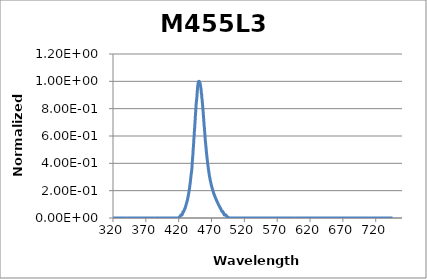
| Category | Normalized Intensity |
|---|---|
| 320.14817633 | 0 |
| 320.25686297 | 0 |
| 320.36555585 | 0 |
| 320.47425497 | 0 |
| 320.58296033 | 0 |
| 320.69167192 | 0 |
| 320.80038974 | 0 |
| 320.9091138 | 0 |
| 321.01784408 | 0 |
| 321.12658059 | 0 |
| 321.23532333 | 0 |
| 321.3440723 | 0 |
| 321.45282748 | 0 |
| 321.56158889 | 0 |
| 321.67035652 | 0 |
| 321.77913037 | 0 |
| 321.88791044 | 0 |
| 321.99669672 | 0 |
| 322.10548922 | 0 |
| 322.21428793 | 0 |
| 322.32309285 | 0 |
| 322.43190398 | 0 |
| 322.54072132 | 0 |
| 322.64954486 | 0 |
| 322.75837461 | 0 |
| 322.86721057 | 0 |
| 322.97605272 | 0 |
| 323.08490108 | 0 |
| 323.19375563 | 0 |
| 323.30261639 | 0 |
| 323.41148333 | 0 |
| 323.52035648 | 0 |
| 323.62923581 | 0 |
| 323.73812134 | 0 |
| 323.84701305 | 0 |
| 323.95591096 | 0 |
| 324.06481505 | 0 |
| 324.17372533 | 0 |
| 324.28264178 | 0 |
| 324.39156443 | 0 |
| 324.50049325 | 0 |
| 324.60942825 | 0 |
| 324.71836943 | 0 |
| 324.82731678 | 0 |
| 324.93627031 | 0 |
| 325.04523001 | 0 |
| 325.15419588 | 0 |
| 325.26316792 | 0 |
| 325.37214613 | 0 |
| 325.48113051 | 0 |
| 325.59012105 | 0 |
| 325.69911775 | 0 |
| 325.80812062 | 0 |
| 325.91712964 | 0 |
| 326.02614483 | 0 |
| 326.13516617 | 0 |
| 326.24419367 | 0 |
| 326.35322732 | 0 |
| 326.46226713 | 0 |
| 326.57131308 | 0 |
| 326.68036519 | 0 |
| 326.78942344 | 0 |
| 326.89848784 | 0 |
| 327.00755839 | 0 |
| 327.11663508 | 0 |
| 327.22571791 | 0 |
| 327.33480688 | 0 |
| 327.44390199 | 0 |
| 327.55300323 | 0 |
| 327.66211061 | 0 |
| 327.77122413 | 0 |
| 327.88034378 | 0 |
| 327.98946956 | 0 |
| 328.09860147 | 0 |
| 328.20773951 | 0 |
| 328.31688367 | 0 |
| 328.42603396 | 0 |
| 328.53519037 | 0 |
| 328.6443529 | 0 |
| 328.75352156 | 0 |
| 328.86269633 | 0 |
| 328.97187722 | 0 |
| 329.08106423 | 0 |
| 329.19025735 | 0 |
| 329.29945658 | 0 |
| 329.40866192 | 0 |
| 329.51787337 | 0 |
| 329.62709093 | 0 |
| 329.7363146 | 0 |
| 329.84554437 | 0 |
| 329.95478025 | 0 |
| 330.06402222 | 0 |
| 330.1732703 | 0 |
| 330.28252448 | 0 |
| 330.39178475 | 0 |
| 330.50105112 | 0 |
| 330.61032358 | 0 |
| 330.71960213 | 0 |
| 330.82888678 | 0 |
| 330.93817751 | 0 |
| 331.04747434 | 0 |
| 331.15677725 | 0 |
| 331.26608624 | 0 |
| 331.37540132 | 0 |
| 331.48472248 | 0 |
| 331.59404972 | 0 |
| 331.70338303 | 0 |
| 331.81272243 | 0 |
| 331.9220679 | 0 |
| 332.03141944 | 0 |
| 332.14077706 | 0 |
| 332.25014075 | 0 |
| 332.3595105 | 0 |
| 332.46888633 | 0 |
| 332.57826822 | 0 |
| 332.68765617 | 0 |
| 332.79705019 | 0 |
| 332.90645027 | 0 |
| 333.01585641 | 0 |
| 333.12526861 | 0 |
| 333.23468687 | 0 |
| 333.34411118 | 0 |
| 333.45354155 | 0 |
| 333.56297796 | 0 |
| 333.67242043 | 0 |
| 333.78186895 | 0 |
| 333.89132352 | 0 |
| 334.00078413 | 0 |
| 334.11025079 | 0 |
| 334.21972349 | 0 |
| 334.32920223 | 0 |
| 334.43868701 | 0 |
| 334.54817783 | 0 |
| 334.65767469 | 0 |
| 334.76717758 | 0 |
| 334.8766865 | 0 |
| 334.98620146 | 0 |
| 335.09572245 | 0 |
| 335.20524947 | 0 |
| 335.31478252 | 0 |
| 335.42432159 | 0 |
| 335.53386669 | 0 |
| 335.64341781 | 0 |
| 335.75297495 | 0 |
| 335.86253811 | 0 |
| 335.97210729 | 0 |
| 336.08168249 | 0 |
| 336.1912637 | 0 |
| 336.30085093 | 0 |
| 336.41044416 | 0 |
| 336.52004341 | 0 |
| 336.62964867 | 0 |
| 336.73925994 | 0 |
| 336.84887721 | 0 |
| 336.95850049 | 0 |
| 337.06812977 | 0 |
| 337.17776505 | 0 |
| 337.28740633 | 0 |
| 337.39705361 | 0 |
| 337.50670688 | 0 |
| 337.61636616 | 0 |
| 337.72603142 | 0 |
| 337.83570268 | 0 |
| 337.94537993 | 0 |
| 338.05506317 | 0 |
| 338.16475239 | 0 |
| 338.2744476 | 0 |
| 338.3841488 | 0 |
| 338.49385598 | 0 |
| 338.60356914 | 0 |
| 338.71328828 | 0 |
| 338.8230134 | 0 |
| 338.93274449 | 0 |
| 339.04248156 | 0 |
| 339.15222461 | 0 |
| 339.26197362 | 0 |
| 339.37172861 | 0 |
| 339.48148957 | 0 |
| 339.59125649 | 0 |
| 339.70102938 | 0 |
| 339.81080823 | 0 |
| 339.92059305 | 0 |
| 340.03038383 | 0 |
| 340.14018057 | 0 |
| 340.24998327 | 0 |
| 340.35979192 | 0 |
| 340.46960653 | 0 |
| 340.57942709 | 0 |
| 340.6892536 | 0 |
| 340.79908607 | 0 |
| 340.90892448 | 0 |
| 341.01876885 | 0 |
| 341.12861915 | 0 |
| 341.2384754 | 0 |
| 341.3483376 | 0 |
| 341.45820574 | 0 |
| 341.56807981 | 0 |
| 341.67795983 | 0 |
| 341.78784578 | 0 |
| 341.89773766 | 0 |
| 342.00763548 | 0 |
| 342.11753924 | 0 |
| 342.22744892 | 0 |
| 342.33736453 | 0 |
| 342.44728607 | 0 |
| 342.55721353 | 0 |
| 342.66714692 | 0 |
| 342.77708623 | 0 |
| 342.88703147 | 0 |
| 342.99698262 | 0 |
| 343.10693969 | 0 |
| 343.21690268 | 0 |
| 343.32687158 | 0 |
| 343.4368464 | 0 |
| 343.54682713 | 0 |
| 343.65681377 | 0 |
| 343.76680631 | 0 |
| 343.87680477 | 0 |
| 343.98680913 | 0 |
| 344.0968194 | 0 |
| 344.20683557 | 0 |
| 344.31685763 | 0 |
| 344.4268856 | 0 |
| 344.53691947 | 0 |
| 344.64695924 | 0 |
| 344.75700489 | 0 |
| 344.86705645 | 0 |
| 344.97711389 | 0 |
| 345.08717723 | 0 |
| 345.19724645 | 0 |
| 345.30732156 | 0 |
| 345.41740256 | 0 |
| 345.52748944 | 0 |
| 345.63758221 | 0 |
| 345.74768085 | 0 |
| 345.85778538 | 0 |
| 345.96789578 | 0 |
| 346.07801206 | 0 |
| 346.18813421 | 0 |
| 346.29826224 | 0 |
| 346.40839614 | 0 |
| 346.51853591 | 0 |
| 346.62868155 | 0 |
| 346.73883306 | 0 |
| 346.84899043 | 0 |
| 346.95915367 | 0 |
| 347.06932277 | 0 |
| 347.17949773 | 0 |
| 347.28967855 | 0 |
| 347.39986522 | 0 |
| 347.51005776 | 0 |
| 347.62025615 | 0 |
| 347.73046039 | 0 |
| 347.84067049 | 0 |
| 347.95088643 | 0 |
| 348.06110823 | 0 |
| 348.17133587 | 0 |
| 348.28156935 | 0 |
| 348.39180868 | 0 |
| 348.50205386 | 0 |
| 348.61230487 | 0 |
| 348.72256173 | 0 |
| 348.83282442 | 0 |
| 348.94309295 | 0 |
| 349.05336731 | 0 |
| 349.16364751 | 0 |
| 349.27393354 | 0 |
| 349.3842254 | 0 |
| 349.49452309 | 0 |
| 349.6048266 | 0 |
| 349.71513594 | 0 |
| 349.82545111 | 0 |
| 349.93577209 | 0 |
| 350.0460989 | 0 |
| 350.15643153 | 0 |
| 350.26676998 | 0 |
| 350.37711424 | 0 |
| 350.48746432 | 0 |
| 350.59782021 | 0 |
| 350.70818191 | 0 |
| 350.81854942 | 0 |
| 350.92892274 | 0 |
| 351.03930187 | 0 |
| 351.14968681 | 0 |
| 351.26007754 | 0 |
| 351.37047409 | 0 |
| 351.48087643 | 0 |
| 351.59128457 | 0 |
| 351.70169851 | 0 |
| 351.81211824 | 0 |
| 351.92254377 | 0 |
| 352.0329751 | 0 |
| 352.14341221 | 0 |
| 352.25385512 | 0 |
| 352.36430381 | 0 |
| 352.47475829 | 0 |
| 352.58521856 | 0 |
| 352.69568461 | 0 |
| 352.80615644 | 0 |
| 352.91663406 | 0 |
| 353.02711745 | 0 |
| 353.13760662 | 0 |
| 353.24810157 | 0 |
| 353.35860229 | 0 |
| 353.46910879 | 0 |
| 353.57962106 | 0 |
| 353.69013909 | 0 |
| 353.8006629 | 0 |
| 353.91119247 | 0 |
| 354.02172781 | 0 |
| 354.13226891 | 0 |
| 354.24281578 | 0 |
| 354.3533684 | 0 |
| 354.46392679 | 0 |
| 354.57449093 | 0 |
| 354.68506083 | 0 |
| 354.79563649 | 0 |
| 354.90621789 | 0 |
| 355.01680505 | 0 |
| 355.12739796 | 0 |
| 355.23799662 | 0 |
| 355.34860102 | 0 |
| 355.45921117 | 0 |
| 355.56982707 | 0 |
| 355.6804487 | 0 |
| 355.79107608 | 0 |
| 355.9017092 | 0 |
| 356.01234805 | 0 |
| 356.12299264 | 0 |
| 356.23364297 | 0 |
| 356.34429902 | 0 |
| 356.45496081 | 0 |
| 356.56562833 | 0 |
| 356.67630158 | 0 |
| 356.78698056 | 0 |
| 356.89766526 | 0 |
| 357.00835568 | 0 |
| 357.11905183 | 0 |
| 357.2297537 | 0 |
| 357.34046128 | 0 |
| 357.45117459 | 0 |
| 357.56189361 | 0 |
| 357.67261835 | 0 |
| 357.78334879 | 0 |
| 357.89408495 | 0 |
| 358.00482682 | 0 |
| 358.1155744 | 0 |
| 358.22632769 | 0 |
| 358.33708668 | 0 |
| 358.44785137 | 0 |
| 358.55862177 | 0 |
| 358.66939787 | 0 |
| 358.78017966 | 0 |
| 358.89096716 | 0 |
| 359.00176035 | 0 |
| 359.11255923 | 0 |
| 359.22336381 | 0 |
| 359.33417408 | 0 |
| 359.44499004 | 0 |
| 359.55581169 | 0 |
| 359.66663902 | 0 |
| 359.77747204 | 0 |
| 359.88831075 | 0 |
| 359.99915513 | 0 |
| 360.1100052 | 0 |
| 360.22086094 | 0 |
| 360.33172237 | 0 |
| 360.44258947 | 0 |
| 360.55346224 | 0 |
| 360.66434069 | 0 |
| 360.77522481 | 0 |
| 360.8861146 | 0 |
| 360.99701005 | 0 |
| 361.10791118 | 0 |
| 361.21881796 | 0 |
| 361.32973042 | 0 |
| 361.44064853 | 0 |
| 361.55157231 | 0 |
| 361.66250174 | 0 |
| 361.77343683 | 0 |
| 361.88437758 | 0 |
| 361.99532398 | 0 |
| 362.10627604 | 0 |
| 362.21723374 | 0 |
| 362.3281971 | 0 |
| 362.43916611 | 0 |
| 362.55014076 | 0 |
| 362.66112105 | 0 |
| 362.77210699 | 0 |
| 362.88309858 | 0 |
| 362.9940958 | 0 |
| 363.10509866 | 0 |
| 363.21610716 | 0 |
| 363.3271213 | 0 |
| 363.43814107 | 0 |
| 363.54916647 | 0 |
| 363.6601975 | 0 |
| 363.77123417 | 0 |
| 363.88227646 | 0 |
| 363.99332438 | 0 |
| 364.10437792 | 0 |
| 364.21543709 | 0 |
| 364.32650188 | 0 |
| 364.43757229 | 0 |
| 364.54864832 | 0 |
| 364.65972997 | 0 |
| 364.77081723 | 0 |
| 364.88191011 | 0 |
| 364.9930086 | 0 |
| 365.1041127 | 0 |
| 365.21522241 | 0 |
| 365.32633773 | 0 |
| 365.43745866 | 0 |
| 365.54858519 | 0 |
| 365.65971732 | 0 |
| 365.77085506 | 0 |
| 365.88199839 | 0 |
| 365.99314733 | 0 |
| 366.10430186 | 0 |
| 366.21546199 | 0 |
| 366.32662772 | 0 |
| 366.43779903 | 0 |
| 366.54897594 | 0 |
| 366.66015844 | 0 |
| 366.77134652 | 0 |
| 366.88254019 | 0 |
| 366.99373945 | 0 |
| 367.10494429 | 0 |
| 367.21615471 | 0 |
| 367.32737072 | 0 |
| 367.4385923 | 0 |
| 367.54981946 | 0 |
| 367.66105219 | 0 |
| 367.7722905 | 0 |
| 367.88353438 | 0 |
| 367.99478384 | 0 |
| 368.10603886 | 0 |
| 368.21729945 | 0 |
| 368.32856561 | 0 |
| 368.43983733 | 0 |
| 368.55111462 | 0 |
| 368.66239746 | 0 |
| 368.77368587 | 0 |
| 368.88497984 | 0 |
| 368.99627936 | 0 |
| 369.10758444 | 0 |
| 369.21889508 | 0 |
| 369.33021127 | 0 |
| 369.441533 | 0 |
| 369.55286029 | 0 |
| 369.66419313 | 0 |
| 369.77553151 | 0 |
| 369.88687544 | 0 |
| 369.99822491 | 0 |
| 370.10957992 | 0 |
| 370.22094047 | 0 |
| 370.33230656 | 0 |
| 370.44367819 | 0 |
| 370.55505536 | 0 |
| 370.66643806 | 0 |
| 370.77782629 | 0 |
| 370.88922005 | 0 |
| 371.00061934 | 0 |
| 371.11202416 | 0 |
| 371.22343451 | 0 |
| 371.33485038 | 0 |
| 371.44627178 | 0 |
| 371.55769869 | 0 |
| 371.66913113 | 0 |
| 371.78056908 | 0 |
| 371.89201256 | 0 |
| 372.00346155 | 0 |
| 372.11491605 | 0 |
| 372.22637606 | 0 |
| 372.33784159 | 0 |
| 372.44931262 | 0 |
| 372.56078917 | 0 |
| 372.67227122 | 0 |
| 372.78375877 | 0 |
| 372.89525183 | 0 |
| 373.00675039 | 0 |
| 373.11825445 | 0 |
| 373.22976401 | 0 |
| 373.34127907 | 0 |
| 373.45279962 | 0 |
| 373.56432566 | 0 |
| 373.6758572 | 0 |
| 373.78739423 | 0 |
| 373.89893675 | 0 |
| 374.01048476 | 0 |
| 374.12203825 | 0 |
| 374.23359723 | 0 |
| 374.34516169 | 0 |
| 374.45673163 | 0 |
| 374.56830705 | 0 |
| 374.67988796 | 0 |
| 374.79147433 | 0 |
| 374.90306619 | 0 |
| 375.01466352 | 0 |
| 375.12626632 | 0 |
| 375.23787459 | 0 |
| 375.34948833 | 0 |
| 375.46110754 | 0 |
| 375.57273221 | 0 |
| 375.68436235 | 0 |
| 375.79599796 | 0 |
| 375.90763902 | 0 |
| 376.01928555 | 0 |
| 376.13093753 | 0 |
| 376.24259497 | 0 |
| 376.35425787 | 0 |
| 376.46592622 | 0 |
| 376.57760002 | 0 |
| 376.68927927 | 0 |
| 376.80096397 | 0 |
| 376.91265413 | 0 |
| 377.02434972 | 0 |
| 377.13605076 | 0 |
| 377.24775725 | 0 |
| 377.35946917 | 0 |
| 377.47118654 | 0 |
| 377.58290935 | 0 |
| 377.69463759 | 0 |
| 377.80637126 | 0 |
| 377.91811038 | 0 |
| 378.02985492 | 0 |
| 378.14160489 | 0 |
| 378.2533603 | 0 |
| 378.36512113 | 0 |
| 378.47688739 | 0 |
| 378.58865907 | 0 |
| 378.70043617 | 0 |
| 378.8122187 | 0 |
| 378.92400665 | 0 |
| 379.03580001 | 0 |
| 379.1475988 | 0 |
| 379.25940299 | 0 |
| 379.37121261 | 0 |
| 379.48302763 | 0 |
| 379.59484806 | 0 |
| 379.70667391 | 0 |
| 379.81850516 | 0 |
| 379.93034182 | 0 |
| 380.04218388 | 0 |
| 380.15403135 | 0 |
| 380.26588421 | 0 |
| 380.37774248 | 0 |
| 380.48960615 | 0 |
| 380.60147521 | 0 |
| 380.71334967 | 0 |
| 380.82522952 | 0 |
| 380.93711476 | 0 |
| 381.0490054 | 0 |
| 381.16090142 | 0 |
| 381.27280283 | 0 |
| 381.38470963 | 0 |
| 381.49662181 | 0 |
| 381.60853938 | 0 |
| 381.72046232 | 0 |
| 381.83239065 | 0 |
| 381.94432436 | 0 |
| 382.05626344 | 0 |
| 382.16820789 | 0 |
| 382.28015772 | 0 |
| 382.39211293 | 0 |
| 382.5040735 | 0 |
| 382.61603944 | 0 |
| 382.72801076 | 0 |
| 382.83998743 | 0 |
| 382.95196947 | 0 |
| 383.06395688 | 0 |
| 383.17594964 | 0 |
| 383.28794777 | 0 |
| 383.39995125 | 0 |
| 383.51196009 | 0 |
| 383.62397429 | 0 |
| 383.73599384 | 0 |
| 383.84801874 | 0 |
| 383.96004899 | 0 |
| 384.07208459 | 0 |
| 384.18412554 | 0 |
| 384.29617184 | 0 |
| 384.40822348 | 0 |
| 384.52028046 | 0 |
| 384.63234278 | 0 |
| 384.74441044 | 0 |
| 384.85648345 | 0 |
| 384.96856178 | 0 |
| 385.08064546 | 0 |
| 385.19273447 | 0 |
| 385.30482881 | 0 |
| 385.41692848 | 0 |
| 385.52903347 | 0 |
| 385.6411438 | 0 |
| 385.75325945 | 0 |
| 385.86538043 | 0 |
| 385.97750673 | 0 |
| 386.08963835 | 0 |
| 386.20177529 | 0 |
| 386.31391755 | 0 |
| 386.42606513 | 0 |
| 386.53821802 | 0 |
| 386.65037622 | 0 |
| 386.76253974 | 0 |
| 386.87470857 | 0 |
| 386.9868827 | 0 |
| 387.09906215 | 0 |
| 387.2112469 | 0 |
| 387.32343695 | 0 |
| 387.43563231 | 0 |
| 387.54783297 | 0 |
| 387.66003892 | 0 |
| 387.77225018 | 0 |
| 387.88446673 | 0 |
| 387.99668858 | 0 |
| 388.10891572 | 0 |
| 388.22114815 | 0 |
| 388.33338588 | 0 |
| 388.44562889 | 0 |
| 388.55787719 | 0 |
| 388.67013078 | 0 |
| 388.78238965 | 0 |
| 388.8946538 | 0 |
| 389.00692323 | 0 |
| 389.11919795 | 0 |
| 389.23147794 | 0 |
| 389.34376321 | 0 |
| 389.45605375 | 0 |
| 389.56834957 | 0 |
| 389.68065066 | 0 |
| 389.79295702 | 0 |
| 389.90526865 | 0 |
| 390.01758554 | 0 |
| 390.1299077 | 0 |
| 390.24223513 | 0 |
| 390.35456782 | 0 |
| 390.46690577 | 0 |
| 390.57924898 | 0 |
| 390.69159745 | 0 |
| 390.80395117 | 0 |
| 390.91631015 | 0 |
| 391.02867438 | 0 |
| 391.14104387 | 0 |
| 391.2534186 | 0 |
| 391.36579858 | 0 |
| 391.47818382 | 0 |
| 391.59057429 | 0 |
| 391.70297001 | 0 |
| 391.81537098 | 0 |
| 391.92777718 | 0 |
| 392.04018863 | 0 |
| 392.15260531 | 0 |
| 392.26502723 | 0 |
| 392.37745438 | 0 |
| 392.48988677 | 0 |
| 392.60232439 | 0 |
| 392.71476724 | 0 |
| 392.82721532 | 0 |
| 392.93966862 | 0 |
| 393.05212715 | 0 |
| 393.16459091 | 0 |
| 393.27705989 | 0 |
| 393.38953408 | 0 |
| 393.5020135 | 0 |
| 393.61449814 | 0 |
| 393.72698799 | 0 |
| 393.83948306 | 0 |
| 393.95198334 | 0 |
| 394.06448883 | 0 |
| 394.17699954 | 0 |
| 394.28951545 | 0 |
| 394.40203657 | 0 |
| 394.51456289 | 0 |
| 394.62709442 | 0 |
| 394.73963116 | 0 |
| 394.85217309 | 0 |
| 394.96472022 | 0 |
| 395.07727255 | 0 |
| 395.18983008 | 0 |
| 395.3023928 | 0 |
| 395.41496071 | 0 |
| 395.52753382 | 0 |
| 395.64011212 | 0 |
| 395.7526956 | 0 |
| 395.86528427 | 0 |
| 395.97787813 | 0 |
| 396.09047717 | 0 |
| 396.2030814 | 0 |
| 396.3156908 | 0 |
| 396.42830539 | 0 |
| 396.54092515 | 0 |
| 396.65355009 | 0 |
| 396.76618021 | 0 |
| 396.87881549 | 0 |
| 396.99145595 | 0 |
| 397.10410158 | 0 |
| 397.21675238 | 0 |
| 397.32940834 | 0 |
| 397.44206947 | 0 |
| 397.55473577 | 0 |
| 397.66740723 | 0 |
| 397.78008384 | 0 |
| 397.89276562 | 0 |
| 398.00545256 | 0 |
| 398.11814465 | 0 |
| 398.23084189 | 0 |
| 398.34354429 | 0 |
| 398.45625184 | 0 |
| 398.56896455 | 0 |
| 398.6816824 | 0 |
| 398.79440539 | 0 |
| 398.90713353 | 0 |
| 399.01986682 | 0 |
| 399.13260525 | 0 |
| 399.24534882 | 0 |
| 399.35809753 | 0 |
| 399.47085137 | 0 |
| 399.58361036 | 0 |
| 399.69637448 | 0 |
| 399.80914373 | 0 |
| 399.92191811 | 0 |
| 400.03469762 | 0 |
| 400.14748226 | 0 |
| 400.26027203 | 0 |
| 400.37306692 | 0 |
| 400.48586694 | 0 |
| 400.59867208 | 0 |
| 400.71148234 | 0 |
| 400.82429772 | 0 |
| 400.93711822 | 0 |
| 401.04994383 | 0 |
| 401.16277456 | 0 |
| 401.2756104 | 0 |
| 401.38845136 | 0 |
| 401.50129742 | 0 |
| 401.61414859 | 0 |
| 401.72700487 | 0 |
| 401.83986625 | 0 |
| 401.95273274 | 0 |
| 402.06560433 | 0 |
| 402.17848102 | 0 |
| 402.29136281 | 0 |
| 402.4042497 | 0 |
| 402.51714169 | 0 |
| 402.63003876 | 0 |
| 402.74294094 | 0 |
| 402.8558482 | 0 |
| 402.96876055 | 0 |
| 403.08167799 | 0 |
| 403.19460052 | 0 |
| 403.30752814 | 0 |
| 403.42046083 | 0 |
| 403.53339861 | 0 |
| 403.64634147 | 0 |
| 403.75928941 | 0 |
| 403.87224243000003 | 0 |
| 403.98520053 | 0 |
| 404.09816369 | 0 |
| 404.21113193 | 0 |
| 404.32410525 | 0 |
| 404.43708363 | 0 |
| 404.55006708 | 0 |
| 404.6630556 | 0 |
| 404.77604918 | 0 |
| 404.88904783 | 0 |
| 405.00205154 | 0 |
| 405.11506031 | 0 |
| 405.22807414 | 0 |
| 405.34109302 | 0 |
| 405.45411697 | 0 |
| 405.56714596 | 0 |
| 405.68018001 | 0 |
| 405.79321911 | 0 |
| 405.90626326 | 0 |
| 406.01931246 | 0 |
| 406.13236671 | 0 |
| 406.245426 | 0 |
| 406.35849034 | 0 |
| 406.47155972 | 0 |
| 406.58463413 | 0 |
| 406.69771359 | 0 |
| 406.81079809 | 0 |
| 406.92388762 | 0 |
| 407.03698218 | 0 |
| 407.15008178 | 0 |
| 407.26318641 | 0 |
| 407.37629607 | 0 |
| 407.48941076 | 0 |
| 407.60253047 | 0 |
| 407.71565521 | 0 |
| 407.82878497 | 0 |
| 407.94191976 | 0 |
| 408.05505956 | 0 |
| 408.16820439 | 0 |
| 408.28135423 | 0 |
| 408.39450909 | 0 |
| 408.50766896 | 0 |
| 408.62083385 | 0 |
| 408.73400375 | 0 |
| 408.84717865 | 0 |
| 408.96035857 | 0 |
| 409.07354349 | 0 |
| 409.18673342 | 0 |
| 409.29992835 | 0 |
| 409.41312828 | 0 |
| 409.52633321 | 0 |
| 409.63954314 | 0 |
| 409.75275807 | 0 |
| 409.865978 | 0 |
| 409.97920292 | 0 |
| 410.09243283 | 0 |
| 410.20566773 | 0 |
| 410.31890763 | 0 |
| 410.43215251 | 0 |
| 410.54540238 | 0 |
| 410.65865723 | 0 |
| 410.77191707 | 0 |
| 410.88518189 | 0 |
| 410.99845169 | 0 |
| 411.11172647 | 0 |
| 411.22500622 | 0 |
| 411.33829095 | 0 |
| 411.45158066 | 0 |
| 411.56487534 | 0 |
| 411.67817499 | 0 |
| 411.79147961 | 0 |
| 411.9047892 | 0 |
| 412.01810375 | 0 |
| 412.13142327 | 0 |
| 412.24474775 | 0 |
| 412.3580772 | 0 |
| 412.4714116 | 0 |
| 412.58475097 | 0 |
| 412.69809529 | 0 |
| 412.81144456 | 0 |
| 412.9247988 | 0 |
| 413.03815798 | 0 |
| 413.15152212 | 0 |
| 413.2648912 | 0 |
| 413.37826523 | 0 |
| 413.49164421 | 0 |
| 413.60502814 | 0 |
| 413.71841701 | 0 |
| 413.83181082 | 0 |
| 413.94520957 | 0 |
| 414.05861326 | 0 |
| 414.17202188 | 0 |
| 414.28543545 | 0 |
| 414.39885394 | 0 |
| 414.51227737 | 0 |
| 414.62570573 | 0 |
| 414.73913902 | 0 |
| 414.85257724 | 0 |
| 414.96602038 | 0 |
| 415.07946845 | 0 |
| 415.19292145 | 0 |
| 415.30637936 | 0 |
| 415.4198422 | 0 |
| 415.53330995 | 0 |
| 415.64678262 | 0 |
| 415.76026021 | 0 |
| 415.87374271 | 0 |
| 415.98723012 | 0 |
| 416.10072245 | 0 |
| 416.21421968 | 0 |
| 416.32772182 | 0 |
| 416.44122887 | 0 |
| 416.55474082 | 0 |
| 416.66825768 | 0 |
| 416.78177944 | 0 |
| 416.8953061 | 0 |
| 417.00883765 | 0 |
| 417.12237411 | 0 |
| 417.23591546 | 0 |
| 417.3494617 | 0 |
| 417.46301284 | 0 |
| 417.57656887 | 0 |
| 417.69012979 | 0 |
| 417.80369559 | 0 |
| 417.91726628 | 0 |
| 418.03084186 | 0 |
| 418.14442232 | 0 |
| 418.25800766 | 0 |
| 418.37159788 | 0 |
| 418.48519298 | 0 |
| 418.59879296 | 0 |
| 418.71239782 | 0 |
| 418.82600754 | 0 |
| 418.93962214 | 0 |
| 419.05324161 | 0 |
| 419.16686595 | 0 |
| 419.28049516 | 0 |
| 419.39412924 | 0 |
| 419.50776818 | 0 |
| 419.62141198 | 0 |
| 419.73506064 | 0.001 |
| 419.84871417 | 0.001 |
| 419.96237255 | 0.002 |
| 420.07603579 | 0.002 |
| 420.18970389 | 0.003 |
| 420.30337684 | 0.003 |
| 420.41705464 | 0.004 |
| 420.53073729 | 0.004 |
| 420.6444248 | 0.005 |
| 420.75811715 | 0.004 |
| 420.87181434 | 0.006 |
| 420.98551638 | 0.006 |
| 421.09922327 | 0.007 |
| 421.212935 | 0.007 |
| 421.32665156 | 0.008 |
| 421.44037297 | 0.008 |
| 421.55409921 | 0.01 |
| 421.66783029 | 0.01 |
| 421.7815662 | 0.011 |
| 421.89530694 | 0.011 |
| 422.00905252 | 0.012 |
| 422.12280292 | 0.012 |
| 422.23655815 | 0.014 |
| 422.35031821 | 0.014 |
| 422.46408309 | 0.016 |
| 422.5778528 | 0.016 |
| 422.69162733 | 0.018 |
| 422.80540667 | 0.018 |
| 422.91919084 | 0.02 |
| 423.03297982 | 0.021 |
| 423.14677362 | 0.022 |
| 423.26057223 | 0.022 |
| 423.37437566 | 0.023 |
| 423.4881839 | 0.023 |
| 423.60199694 | 0.023 |
| 423.71581479 | 0.023 |
| 423.82963745 | 0.022 |
| 423.94346492 | 0.024 |
| 424.05729718 | 0.023 |
| 424.17113425 | 0.024 |
| 424.28497612 | 0.024 |
| 424.39882279 | 0.025 |
| 424.51267425 | 0.025 |
| 424.62653051 | 0.024 |
| 424.74039156 | 0.024 |
| 424.85425741 | 0.023 |
| 424.96812804 | 0.023 |
| 425.08200347 | 0.022 |
| 425.19588368 | 0.024 |
| 425.30976868 | 0.024 |
| 425.42365846 | 0.026 |
| 425.53755303 | 0.026 |
| 425.65145238 | 0.031 |
| 425.76535651 | 0.031 |
| 425.87926541 | 0.035 |
| 425.9931791 | 0.034 |
| 426.10709756 | 0.036 |
| 426.22102079 | 0.036 |
| 426.33494879 | 0.037 |
| 426.44888157 | 0.04 |
| 426.56281911 | 0.043 |
| 426.67676143 | 0.046 |
| 426.7907085 | 0.047 |
| 426.90466035 | 0.047 |
| 427.01861695 | 0.047 |
| 427.13257832 | 0.046 |
| 427.24654445 | 0.046 |
| 427.36051534 | 0.045 |
| 427.47449098 | 0.047 |
| 427.58847138 | 0.047 |
| 427.70245653 | 0.049 |
| 427.81644643 | 0.048 |
| 427.93044109 | 0.05 |
| 428.04444049 | 0.051 |
| 428.15844464 | 0.053 |
| 428.27245354 | 0.054 |
| 428.38646718 | 0.057 |
| 428.50048557 | 0.058 |
| 428.61450869 | 0.06 |
| 428.72853656 | 0.061 |
| 428.84256916 | 0.063 |
| 428.9566065 | 0.064 |
| 429.07064858 | 0.065 |
| 429.18469539 | 0.066 |
| 429.29874693 | 0.069 |
| 429.41280321 | 0.07 |
| 429.52686421 | 0.071 |
| 429.64092994 | 0.071 |
| 429.75500039 | 0.073 |
| 429.86907557 | 0.074 |
| 429.98315548 | 0.076 |
| 430.0972401 | 0.077 |
| 430.21132944 | 0.079 |
| 430.32542351 | 0.081 |
| 430.43952229 | 0.083 |
| 430.55362578 | 0.084 |
| 430.66773399 | 0.086 |
| 430.78184691 | 0.088 |
| 430.89596454 | 0.09 |
| 431.01008688 | 0.093 |
| 431.12421393 | 0.094 |
| 431.23834568 | 0.096 |
| 431.35248214 | 0.098 |
| 431.4666233 | 0.1 |
| 431.58076916 | 0.101 |
| 431.69491972 | 0.104 |
| 431.80907498 | 0.105 |
| 431.92323494 | 0.108 |
| 432.03739959 | 0.108 |
| 432.15156893 | 0.111 |
| 432.26574297 | 0.112 |
| 432.3799217 | 0.115 |
| 432.49410511 | 0.117 |
| 432.60829322 | 0.12 |
| 432.72248601 | 0.122 |
| 432.83668348 | 0.125 |
| 432.95088564 | 0.126 |
| 433.06509248 | 0.129 |
| 433.179304 | 0.13 |
| 433.29352019 | 0.133 |
| 433.40774107 | 0.135 |
| 433.52196661 | 0.138 |
| 433.63619684 | 0.139 |
| 433.75043173 | 0.143 |
| 433.86467129 | 0.145 |
| 433.97891553 | 0.148 |
| 434.09316443 | 0.15 |
| 434.20741799 | 0.153 |
| 434.32167622 | 0.155 |
| 434.43593912 | 0.158 |
| 434.55020667 | 0.161 |
| 434.66447889 | 0.165 |
| 434.77875576 | 0.168 |
| 434.89303729 | 0.172 |
| 435.00732347 | 0.174 |
| 435.12161431 | 0.177 |
| 435.2359098 | 0.179 |
| 435.35020994 | 0.182 |
| 435.46451473 | 0.185 |
| 435.57882416 | 0.19 |
| 435.69313824 | 0.192 |
| 435.80745697 | 0.197 |
| 435.92178034 | 0.2 |
| 436.03610835 | 0.204 |
| 436.150441 | 0.206 |
| 436.26477829 | 0.211 |
| 436.37912021 | 0.214 |
| 436.49346677 | 0.219 |
| 436.60781796 | 0.222 |
| 436.72217379 | 0.227 |
| 436.83653424 | 0.231 |
| 436.95089932 | 0.236 |
| 437.06526904 | 0.239 |
| 437.17964337 | 0.244 |
| 437.29402233 | 0.247 |
| 437.40840592 | 0.251 |
| 437.52279412 | 0.255 |
| 437.63718695 | 0.26 |
| 437.75158439 | 0.264 |
| 437.86598645 | 0.271 |
| 437.98039312 | 0.275 |
| 438.09480441 | 0.281 |
| 438.20922031 | 0.284 |
| 438.32364082 | 0.289 |
| 438.43806593 | 0.294 |
| 438.55249566 | 0.3 |
| 438.66692999 | 0.305 |
| 438.78136893 | 0.311 |
| 438.89581246 | 0.314 |
| 439.0102606 | 0.319 |
| 439.12471334 | 0.322 |
| 439.23917068 | 0.327 |
| 439.35363261 | 0.33 |
| 439.46809914 | 0.334 |
| 439.58257026 | 0.338 |
| 439.69704597 | 0.344 |
| 439.81152627 | 0.348 |
| 439.92601117 | 0.355 |
| 440.04050065 | 0.359 |
| 440.15499471 | 0.367 |
| 440.26949336 | 0.374 |
| 440.38399659 | 0.384 |
| 440.4985044 | 0.392 |
| 440.61301679 | 0.402 |
| 440.72753376 | 0.408 |
| 440.84205531 | 0.416 |
| 440.95658143 | 0.422 |
| 441.07111213 | 0.43 |
| 441.18564739 | 0.437 |
| 441.30018723 | 0.445 |
| 441.41473163 | 0.451 |
| 441.5292806 | 0.459 |
| 441.64383414 | 0.465 |
| 441.75839224 | 0.474 |
| 441.87295491 | 0.484 |
| 441.98752213 | 0.495 |
| 442.10209392 | 0.503 |
| 442.21667026 | 0.511 |
| 442.33125116 | 0.516 |
| 442.44583661 | 0.522 |
| 442.56042662 | 0.528 |
| 442.67502118 | 0.537 |
| 442.78962029 | 0.547 |
| 442.90422394 | 0.56 |
| 443.01883215 | 0.57 |
| 443.1334449 | 0.579 |
| 443.24806219 | 0.585 |
| 443.36268403 | 0.591 |
| 443.47731041 | 0.599 |
| 443.59194132 | 0.609 |
| 443.70657678 | 0.619 |
| 443.82121677 | 0.629 |
| 443.93586129 | 0.635 |
| 444.05051035 | 0.642 |
| 444.16516394 | 0.647 |
| 444.27982206 | 0.655 |
| 444.39448471 | 0.664 |
| 444.50915189 | 0.674 |
| 444.62382359 | 0.684 |
| 444.73849982 | 0.695 |
| 444.85318056 | 0.702 |
| 444.96786583 | 0.711 |
| 445.08255562 | 0.718 |
| 445.19724993 | 0.728 |
| 445.31194875 | 0.737 |
| 445.42665209 | 0.747 |
| 445.54135994 | 0.755 |
| 445.6560723 | 0.763 |
| 445.77078917 | 0.77 |
| 445.88551055 | 0.779 |
| 446.00023644 | 0.786 |
| 446.11496683 | 0.797 |
| 446.22970173 | 0.806 |
| 446.34444113 | 0.816 |
| 446.45918503 | 0.823 |
| 446.57393342 | 0.83 |
| 446.68868632 | 0.835 |
| 446.80344371 | 0.841 |
| 446.9182056 | 0.848 |
| 447.03297198 | 0.855 |
| 447.14774285 | 0.86 |
| 447.26251822 | 0.864 |
| 447.37729807 | 0.866 |
| 447.49208241 | 0.872 |
| 447.60687123 | 0.878 |
| 447.72166453 | 0.887 |
| 447.83646232 | 0.896 |
| 447.95126459 | 0.904 |
| 448.06607134 | 0.91 |
| 448.18088257 | 0.917 |
| 448.29569827 | 0.924 |
| 448.41051845 | 0.933 |
| 448.5253431 | 0.94 |
| 448.64017222 | 0.948 |
| 448.75500582 | 0.955 |
| 448.86984388 | 0.961 |
| 448.9846864 | 0.966 |
| 449.0995334 | 0.97 |
| 449.21438485 | 0.972 |
| 449.32924077 | 0.976 |
| 449.44410115 | 0.98 |
| 449.55896599 | 0.986 |
| 449.67383529 | 0.989 |
| 449.78870904 | 0.993 |
| 449.90358725 | 0.993 |
| 450.01846991 | 0.993 |
| 450.13335702 | 0.992 |
| 450.24824858 | 0.994 |
| 450.36314459 | 0.995 |
| 450.47804504 | 0.998 |
| 450.59294995 | 0.999 |
| 450.70785929 | 1 |
| 450.82277308 | 0.998 |
| 450.93769131 | 0.997 |
| 451.05261398 | 0.997 |
| 451.16754108 | 0.999 |
| 451.28247262 | 1 |
| 451.3974086 | 1 |
| 451.51234901 | 0.998 |
| 451.62729385 | 0.997 |
| 451.74224312 | 0.994 |
| 451.85719681 | 0.993 |
| 451.97215494 | 0.991 |
| 452.08711749 | 0.991 |
| 452.20208446 | 0.99 |
| 452.31705586 | 0.99 |
| 452.43203168 | 0.987 |
| 452.54701191 | 0.985 |
| 452.66199657 | 0.981 |
| 452.77698563 | 0.98 |
| 452.89197912 | 0.977 |
| 453.00697702 | 0.976 |
| 453.12197932 | 0.972 |
| 453.23698604 | 0.969 |
| 453.35199717 | 0.964 |
| 453.4670127 | 0.96 |
| 453.58203264 | 0.956 |
| 453.69705698 | 0.954 |
| 453.81208572 | 0.95 |
| 453.92711887 | 0.947 |
| 454.04215641 | 0.94 |
| 454.15719835 | 0.934 |
| 454.27224469 | 0.926 |
| 454.38729542 | 0.922 |
| 454.50235054 | 0.916 |
| 454.61741006 | 0.913 |
| 454.73247396 | 0.909 |
| 454.84754226 | 0.906 |
| 454.96261494 | 0.901 |
| 455.077692 | 0.894 |
| 455.19277345 | 0.885 |
| 455.30785928 | 0.879 |
| 455.42294949 | 0.875 |
| 455.53804408 | 0.872 |
| 455.65314305 | 0.867 |
| 455.76824639 | 0.862 |
| 455.88335411 | 0.854 |
| 455.9984662 | 0.847 |
| 456.11358267 | 0.838 |
| 456.2287035 | 0.833 |
| 456.3438287 | 0.827 |
| 456.45895826 | 0.823 |
| 456.5740922 | 0.817 |
| 456.68923049 | 0.812 |
| 456.80437315 | 0.804 |
| 456.91952017 | 0.798 |
| 457.03467154 | 0.791 |
| 457.14982728 | 0.785 |
| 457.26498737 | 0.776 |
| 457.38015181 | 0.768 |
| 457.49532061 | 0.758 |
| 457.61049375 | 0.752 |
| 457.72567125 | 0.744 |
| 457.8408531 | 0.738 |
| 457.95603929 | 0.731 |
| 458.07122983 | 0.726 |
| 458.18642471 | 0.719 |
| 458.30162393 | 0.711 |
| 458.41682749 | 0.699 |
| 458.5320354 | 0.69 |
| 458.64724764 | 0.681 |
| 458.76246421 | 0.676 |
| 458.87768512 | 0.671 |
| 458.99291036 | 0.668 |
| 459.10813994 | 0.661 |
| 459.22337384 | 0.655 |
| 459.33861207 | 0.645 |
| 459.45385463 | 0.638 |
| 459.56910151 | 0.63 |
| 459.68435272 | 0.624 |
| 459.79960824 | 0.617 |
| 459.91486809 | 0.611 |
| 460.03013226 | 0.603 |
| 460.14540074 | 0.595 |
| 460.26067354 | 0.586 |
| 460.37595066 | 0.577 |
| 460.49123209 | 0.571 |
| 460.60651782 | 0.564 |
| 460.72180787 | 0.561 |
| 460.83710223 | 0.555 |
| 460.95240089 | 0.55 |
| 461.06770386 | 0.543 |
| 461.18301113 | 0.538 |
| 461.2983227 | 0.531 |
| 461.41363857 | 0.525 |
| 461.52895874 | 0.518 |
| 461.64428321 | 0.514 |
| 461.75961198 | 0.508 |
| 461.87494503 | 0.504 |
| 461.99028239 | 0.496 |
| 462.10562403 | 0.49 |
| 462.22096996 | 0.482 |
| 462.33632018 | 0.477 |
| 462.45167468 | 0.472 |
| 462.56703348 | 0.468 |
| 462.68239655 | 0.463 |
| 462.79776391 | 0.458 |
| 462.91313554 | 0.451 |
| 463.02851146 | 0.446 |
| 463.14389165 | 0.44 |
| 463.25927612 | 0.437 |
| 463.37466486 | 0.431 |
| 463.49005787 | 0.428 |
| 463.60545516 | 0.422 |
| 463.72085671 | 0.417 |
| 463.83626254 | 0.411 |
| 463.95167263 | 0.407 |
| 464.06708698 | 0.402 |
| 464.1825056 | 0.399 |
| 464.29792848 | 0.394 |
| 464.41335562 | 0.391 |
| 464.52878702 | 0.386 |
| 464.64422267 | 0.382 |
| 464.75966258 | 0.377 |
| 464.87510675 | 0.374 |
| 464.99055516 | 0.368 |
| 465.10600783 | 0.364 |
| 465.22146475 | 0.359 |
| 465.33692591 | 0.356 |
| 465.45239133 | 0.351 |
| 465.56786098 | 0.349 |
| 465.68333488 | 0.344 |
| 465.79881303 | 0.341 |
| 465.91429541 | 0.336 |
| 466.02978203 | 0.334 |
| 466.14527288 | 0.329 |
| 466.26076798 | 0.327 |
| 466.3762673 | 0.323 |
| 466.49177086 | 0.319 |
| 466.60727865 | 0.314 |
| 466.72279067 | 0.311 |
| 466.83830692 | 0.308 |
| 466.9538274 | 0.306 |
| 467.06935209 | 0.302 |
| 467.18488102 | 0.3 |
| 467.30041416 | 0.296 |
| 467.41595152 | 0.294 |
| 467.53149311 | 0.29 |
| 467.6470389 | 0.288 |
| 467.76258892 | 0.284 |
| 467.87814315 | 0.282 |
| 467.99370159 | 0.278 |
| 468.10926424 | 0.276 |
| 468.2248311 | 0.272 |
| 468.34040217 | 0.271 |
| 468.45597745 | 0.268 |
| 468.57155693 | 0.267 |
| 468.68714061 | 0.263 |
| 468.80272849 | 0.261 |
| 468.91832058 | 0.258 |
| 469.03391686 | 0.256 |
| 469.14951734 | 0.253 |
| 469.26512202 | 0.25 |
| 469.38073089 | 0.247 |
| 469.49634395 | 0.245 |
| 469.6119612 | 0.242 |
| 469.72758264 | 0.241 |
| 469.84320827 | 0.239 |
| 469.95883809 | 0.237 |
| 470.07447209 | 0.234 |
| 470.19011027 | 0.233 |
| 470.30575264 | 0.229 |
| 470.42139918 | 0.228 |
| 470.53704991 | 0.225 |
| 470.65270481 | 0.224 |
| 470.76836388 | 0.222 |
| 470.88402713 | 0.221 |
| 470.99969455 | 0.217 |
| 471.11536615 | 0.216 |
| 471.23104191 | 0.213 |
| 471.34672184 | 0.212 |
| 471.46240593 | 0.21 |
| 471.5780942 | 0.21 |
| 471.69378662 | 0.207 |
| 471.8094832 | 0.205 |
| 471.92518395 | 0.201 |
| 472.04088885 | 0.199 |
| 472.15659791 | 0.196 |
| 472.27231113 | 0.196 |
| 472.3880285 | 0.195 |
| 472.50375002 | 0.194 |
| 472.61947569 | 0.192 |
| 472.73520551 | 0.189 |
| 472.85093948 | 0.186 |
| 472.9666776 | 0.185 |
| 473.08241986 | 0.183 |
| 473.19816626 | 0.183 |
| 473.3139168 | 0.181 |
| 473.42967149 | 0.18 |
| 473.54543031 | 0.177 |
| 473.66119327 | 0.176 |
| 473.77696036 | 0.173 |
| 473.89273159 | 0.172 |
| 474.00850695 | 0.171 |
| 474.12428644 | 0.171 |
| 474.24007006 | 0.17 |
| 474.35585781 | 0.169 |
| 474.47164969 | 0.165 |
| 474.58744568 | 0.164 |
| 474.70324581 | 0.162 |
| 474.81905005 | 0.161 |
| 474.93485841 | 0.16 |
| 475.05067089 | 0.159 |
| 475.16648749 | 0.158 |
| 475.2823082 | 0.157 |
| 475.39813303 | 0.154 |
| 475.51396197 | 0.153 |
| 475.62979502 | 0.151 |
| 475.74563218 | 0.15 |
| 475.86147344 | 0.148 |
| 475.97731881 | 0.148 |
| 476.09316829 | 0.146 |
| 476.20902187 | 0.145 |
| 476.32487955 | 0.143 |
| 476.44074133 | 0.143 |
| 476.55660721 | 0.141 |
| 476.67247718 | 0.141 |
| 476.78835125 | 0.138 |
| 476.90422942 | 0.138 |
| 477.02011167 | 0.136 |
| 477.13599802 | 0.135 |
| 477.25188846 | 0.133 |
| 477.36778298 | 0.132 |
| 477.48368159 | 0.13 |
| 477.59958428 | 0.13 |
| 477.71549106 | 0.128 |
| 477.83140192 | 0.128 |
| 477.94731686 | 0.126 |
| 478.06323587 | 0.125 |
| 478.17915896 | 0.123 |
| 478.29508613 | 0.123 |
| 478.41101737 | 0.121 |
| 478.52695269 | 0.121 |
| 478.64289207 | 0.119 |
| 478.75883552 | 0.118 |
| 478.87478304 | 0.116 |
| 478.99073463 | 0.116 |
| 479.10669028 | 0.114 |
| 479.22264999 | 0.113 |
| 479.33861377 | 0.111 |
| 479.4545816 | 0.11 |
| 479.57055349 | 0.108 |
| 479.68652944 | 0.108 |
| 479.80250945 | 0.107 |
| 479.9184935 | 0.106 |
| 480.03448161 | 0.104 |
| 480.15047377 | 0.102 |
| 480.26646998 | 0.1 |
| 480.38247024 | 0.1 |
| 480.49847454 | 0.098 |
| 480.61448289 | 0.098 |
| 480.73049528 | 0.097 |
| 480.84651171 | 0.097 |
| 480.96253218 | 0.094 |
| 481.07855669 | 0.094 |
| 481.19458523 | 0.092 |
| 481.31061781 | 0.092 |
| 481.42665442 | 0.091 |
| 481.54269507 | 0.09 |
| 481.65873974 | 0.088 |
| 481.77478845 | 0.087 |
| 481.89084118 | 0.085 |
| 482.00689794 | 0.085 |
| 482.12295872 | 0.083 |
| 482.23902352 | 0.083 |
| 482.35509235 | 0.083 |
| 482.4711652 | 0.083 |
| 482.58724206 | 0.081 |
| 482.70332294 | 0.08 |
| 482.81940783 | 0.077 |
| 482.93549674 | 0.076 |
| 483.05158966 | 0.075 |
| 483.16768659 | 0.075 |
| 483.28378753 | 0.074 |
| 483.39989248 | 0.074 |
| 483.51600143 | 0.072 |
| 483.63211439 | 0.071 |
| 483.74823135 | 0.069 |
| 483.86435231 | 0.068 |
| 483.98047727 | 0.066 |
| 484.09660622 | 0.066 |
| 484.21273918 | 0.065 |
| 484.32887613 | 0.065 |
| 484.44501707 | 0.064 |
| 484.56116201 | 0.063 |
| 484.67731093 | 0.062 |
| 484.79346384 | 0.061 |
| 484.90962075 | 0.059 |
| 485.02578163 | 0.058 |
| 485.1419465 | 0.056 |
| 485.25811536 | 0.056 |
| 485.37428819 | 0.053 |
| 485.490465 | 0.053 |
| 485.6066458 | 0.05 |
| 485.72283056 | 0.05 |
| 485.83901931 | 0.049 |
| 485.95521202 | 0.049 |
| 486.07140871 | 0.048 |
| 486.18760937 | 0.048 |
| 486.303814 | 0.046 |
| 486.42002259 | 0.046 |
| 486.53623515 | 0.045 |
| 486.65245168 | 0.045 |
| 486.76867216 | 0.045 |
| 486.88489661 | 0.046 |
| 487.00112502 | 0.047 |
| 487.11735738 | 0.047 |
| 487.2335937 | 0.047 |
| 487.34983398 | 0.046 |
| 487.46607821 | 0.044 |
| 487.58232639 | 0.042 |
| 487.69857852 | 0.04 |
| 487.8148346 | 0.038 |
| 487.93109463 | 0.037 |
| 488.0473586 | 0.036 |
| 488.16362652 | 0.035 |
| 488.27989838 | 0.036 |
| 488.39617418 | 0.034 |
| 488.51245392 | 0.035 |
| 488.6287376 | 0.031 |
| 488.74502521 | 0.031 |
| 488.86131676 | 0.027 |
| 488.97761224 | 0.028 |
| 489.09391165 | 0.025 |
| 489.210215 | 0.025 |
| 489.32652227 | 0.022 |
| 489.44283347 | 0.023 |
| 489.55914859 | 0.023 |
| 489.67546764 | 0.024 |
| 489.79179062 | 0.024 |
| 489.90811751 | 0.025 |
| 490.02444832 | 0.025 |
| 490.14078305 | 0.025 |
| 490.25712169 | 0.024 |
| 490.37346426 | 0.025 |
| 490.48981073 | 0.023 |
| 490.60616111 | 0.024 |
| 490.72251541 | 0.023 |
| 490.83887361 | 0.024 |
| 490.95523573 | 0.023 |
| 491.07160174 | 0.024 |
| 491.18797166 | 0.023 |
| 491.30434549 | 0.023 |
| 491.42072321 | 0.023 |
| 491.53710483 | 0.023 |
| 491.65349035 | 0.023 |
| 491.76987977 | 0.022 |
| 491.88627308 | 0.022 |
| 492.00267029 | 0.02 |
| 492.11907138 | 0.02 |
| 492.23547637 | 0.019 |
| 492.35188524 | 0.019 |
| 492.46829801 | 0.017 |
| 492.58471465 | 0.017 |
| 492.70113519 | 0.015 |
| 492.8175596 | 0.015 |
| 492.93398789 | 0.013 |
| 493.05042007 | 0.013 |
| 493.16685612 | 0.012 |
| 493.28329605 | 0.012 |
| 493.39973985 | 0.011 |
| 493.51618752 | 0.012 |
| 493.63263907 | 0.011 |
| 493.74909449 | 0.011 |
| 493.86555377 | 0.01 |
| 493.98201693 | 0.01 |
| 494.09848394 | 0.009 |
| 494.21495482 | 0.009 |
| 494.33142957 | 0.007 |
| 494.44790817 | 0.008 |
| 494.56439064 | 0.007 |
| 494.68087696 | 0.007 |
| 494.79736714 | 0.006 |
| 494.91386117 | 0.006 |
| 495.03035905 | 0.005 |
| 495.14686079 | 0.006 |
| 495.26336638 | 0.005 |
| 495.37987581 | 0.005 |
| 495.49638909 | 0.004 |
| 495.61290622 | 0.004 |
| 495.72942719 | 0.003 |
| 495.845952 | 0.003 |
| 495.96248066 | 0.003 |
| 496.07901315 | 0.003 |
| 496.19554948 | 0.002 |
| 496.31208965 | 0.002 |
| 496.42863365 | 0.001 |
| 496.54518149 | 0.002 |
| 496.66173315 | 0.001 |
| 496.77828865 | 0.001 |
| 496.89484797 | 0.001 |
| 497.01141112 | 0.001 |
| 497.1279781 | 0 |
| 497.2445489 | 0.001 |
| 497.36112352 | 0 |
| 497.47770196 | 0 |
| 497.59428422 | 0 |
| 497.7108703 | 0 |
| 497.8274602 | 0 |
| 497.94405391 | 0 |
| 498.06065143 | 0 |
| 498.17725277 | 0 |
| 498.29385791 | 0 |
| 498.41046686 | 0 |
| 498.52707962 | 0 |
| 498.64369619 | 0 |
| 498.76031656 | 0 |
| 498.87694073 | 0 |
| 498.9935687 | 0 |
| 499.11020047 | 0 |
| 499.22683603 | 0 |
| 499.3434754 | 0 |
| 499.46011856 | 0 |
| 499.57676551 | 0 |
| 499.69341625 | 0 |
| 499.81007078 | 0 |
| 499.9267291 | 0 |
| 500.04339121 | 0 |
| 500.1600571 | 0 |
| 500.27672677 | 0 |
| 500.39340023 | 0 |
| 500.51007747 | 0 |
| 500.62675849 | 0 |
| 500.74344328 | 0 |
| 500.86013185 | 0 |
| 500.9768242 | 0 |
| 501.09352032 | 0 |
| 501.21022021 | 0 |
| 501.32692387 | 0 |
| 501.44363129 | 0 |
| 501.56034249 | 0 |
| 501.67705745 | 0 |
| 501.79377617 | 0 |
| 501.91049865 | 0 |
| 502.0272249 | 0 |
| 502.1439549 | 0 |
| 502.26068866 | 0 |
| 502.37742618 | 0 |
| 502.49416745 | 0 |
| 502.61091248 | 0 |
| 502.72766125 | 0 |
| 502.84441378 | 0 |
| 502.96117005 | 0 |
| 503.07793007 | 0 |
| 503.19469384 | 0 |
| 503.31146135 | 0 |
| 503.4282326 | 0 |
| 503.54500759 | 0 |
| 503.66178632 | 0 |
| 503.77856879 | 0 |
| 503.89535499 | 0 |
| 504.01214493 | 0 |
| 504.1289386 | 0 |
| 504.245736 | 0 |
| 504.36253713 | 0 |
| 504.47934199 | 0 |
| 504.59615058 | 0 |
| 504.71296289 | 0 |
| 504.82977892 | 0 |
| 504.94659868 | 0 |
| 505.06342216 | 0 |
| 505.18024935 | 0 |
| 505.29708027 | 0 |
| 505.41391489 | 0 |
| 505.53075324 | 0 |
| 505.64759529 | 0 |
| 505.76444106 | 0 |
| 505.88129054 | 0 |
| 505.99814372 | 0 |
| 506.11500061 | 0 |
| 506.23186121 | 0 |
| 506.34872551 | 0 |
| 506.46559351 | 0 |
| 506.58246521 | 0 |
| 506.69934061 | 0 |
| 506.81621971 | 0 |
| 506.9331025 | 0 |
| 507.04998899 | 0 |
| 507.16687917 | 0 |
| 507.28377304 | 0 |
| 507.4006706 | 0 |
| 507.51757185 | 0 |
| 507.63447679 | 0 |
| 507.75138541 | 0 |
| 507.86829771 | 0 |
| 507.9852137 | 0 |
| 508.10213336 | 0 |
| 508.21905671 | 0 |
| 508.33598373 | 0 |
| 508.45291443 | 0 |
| 508.5698488 | 0 |
| 508.68678684 | 0 |
| 508.80372856 | 0 |
| 508.92067394 | 0 |
| 509.037623 | 0 |
| 509.15457572 | 0 |
| 509.2715321 | 0 |
| 509.38849215 | 0 |
| 509.50545586 | 0 |
| 509.62242323 | 0 |
| 509.73939426 | 0 |
| 509.85636894 | 0 |
| 509.97334728 | 0 |
| 510.09032928 | 0 |
| 510.20731492 | 0 |
| 510.32430422 | 0 |
| 510.44129717 | 0 |
| 510.55829377 | 0 |
| 510.67529401 | 0 |
| 510.7922979 | 0 |
| 510.90930543 | 0 |
| 511.0263166 | 0 |
| 511.14333141 | 0 |
| 511.26034986 | 0 |
| 511.37737195 | 0 |
| 511.49439768 | 0 |
| 511.61142703 | 0 |
| 511.72846002 | 0 |
| 511.84549664 | 0 |
| 511.9625369 | 0 |
| 512.07958077 | 0 |
| 512.19662828 | 0 |
| 512.31367941 | 0 |
| 512.43073416 | 0 |
| 512.54779254 | 0 |
| 512.66485453 | 0 |
| 512.78192014 | 0 |
| 512.89898937 | 0 |
| 513.01606222 | 0 |
| 513.13313868 | 0 |
| 513.25021875 | 0 |
| 513.36730244 | 0 |
| 513.48438973 | 0 |
| 513.60148063 | 0 |
| 513.71857514 | 0 |
| 513.83567325 | 0 |
| 513.95277496 | 0 |
| 514.06988028 | 0 |
| 514.18698919 | 0 |
| 514.30410171 | 0 |
| 514.42121782 | 0 |
| 514.53833753 | 0 |
| 514.65546083 | 0 |
| 514.77258772 | 0 |
| 514.88971821 | 0 |
| 515.00685228 | 0 |
| 515.12398994 | 0 |
| 515.24113119 | 0 |
| 515.35827602 | 0 |
| 515.47542444 | 0 |
| 515.59257644 | 0 |
| 515.70973201 | 0 |
| 515.82689117 | 0 |
| 515.9440539 | 0 |
| 516.06122021 | 0 |
| 516.17839009 | 0 |
| 516.29556355 | 0 |
| 516.41274057 | 0 |
| 516.52992117 | 0 |
| 516.64710533 | 0 |
| 516.76429306 | 0 |
| 516.88148435 | 0 |
| 516.99867921 | 0 |
| 517.11587762 | 0 |
| 517.2330796 | 0 |
| 517.35028514 | 0 |
| 517.46749423 | 0 |
| 517.58470688 | 0 |
| 517.70192308 | 0 |
| 517.81914284 | 0 |
| 517.93636614 | 0 |
| 518.053593 | 0 |
| 518.1708234 | 0 |
| 518.28805735 | 0 |
| 518.40529484 | 0 |
| 518.52253587 | 0 |
| 518.63978045 | 0 |
| 518.75702857 | 0 |
| 518.87428022 | 0 |
| 518.99153542 | 0 |
| 519.10879414 | 0 |
| 519.22605641 | 0 |
| 519.3433222 | 0 |
| 519.46059152 | 0 |
| 519.57786438 | 0 |
| 519.69514076 | 0 |
| 519.81242067 | 0 |
| 519.9297041 | 0 |
| 520.04699105 | 0 |
| 520.16428153 | 0 |
| 520.28157553 | 0 |
| 520.39887304 | 0 |
| 520.51617407 | 0 |
| 520.63347862 | 0 |
| 520.75078668 | 0 |
| 520.86809825 | 0 |
| 520.98541334 | 0 |
| 521.10273193 | 0 |
| 521.22005403 | 0 |
| 521.33737963 | 0 |
| 521.45470874 | 0 |
| 521.57204136 | 0 |
| 521.68937747 | 0 |
| 521.80671709 | 0 |
| 521.9240602 | 0 |
| 522.04140681 | 0 |
| 522.15875691 | 0 |
| 522.27611051 | 0 |
| 522.3934676 | 0 |
| 522.51082819 | 0 |
| 522.62819226 | 0 |
| 522.74555981 | 0 |
| 522.86293086 | 0 |
| 522.98030539 | 0 |
| 523.0976834 | 0 |
| 523.21506489 | 0 |
| 523.33244986 | 0 |
| 523.44983831 | 0 |
| 523.56723024 | 0 |
| 523.68462564 | 0 |
| 523.80202452 | 0 |
| 523.91942687 | 0 |
| 524.03683269 | 0 |
| 524.15424197 | 0 |
| 524.27165473 | 0 |
| 524.38907095 | 0 |
| 524.50649064 | 0 |
| 524.62391378 | 0 |
| 524.74134039 | 0 |
| 524.85877046 | 0 |
| 524.97620399 | 0 |
| 525.09364097 | 0 |
| 525.21108141 | 0 |
| 525.32852531 | 0 |
| 525.44597265 | 0 |
| 525.56342345 | 0 |
| 525.68087769 | 0 |
| 525.79833538 | 0 |
| 525.91579652 | 0 |
| 526.0332611 | 0 |
| 526.15072913 | 0 |
| 526.26820059 | 0 |
| 526.3856755 | 0 |
| 526.50315384 | 0 |
| 526.62063562 | 0 |
| 526.73812084 | 0 |
| 526.85560949 | 0 |
| 526.97310157 | 0 |
| 527.09059708 | 0 |
| 527.20809602 | 0 |
| 527.32559839 | 0 |
| 527.44310418 | 0 |
| 527.5606134 | 0 |
| 527.67812604 | 0 |
| 527.7956421 | 0 |
| 527.91316159 | 0 |
| 528.03068449 | 0 |
| 528.1482108 | 0 |
| 528.26574053 | 0 |
| 528.38327368 | 0 |
| 528.50081023 | 0 |
| 528.6183502 | 0 |
| 528.73589358 | 0 |
| 528.85344036 | 0 |
| 528.97099055 | 0 |
| 529.08854414 | 0 |
| 529.20610114 | 0 |
| 529.32366154 | 0 |
| 529.44122533 | 0 |
| 529.55879253 | 0 |
| 529.67636312 | 0 |
| 529.7939371 | 0 |
| 529.91151448 | 0 |
| 530.02909526 | 0 |
| 530.14667942 | 0 |
| 530.26426697 | 0 |
| 530.38185791 | 0 |
| 530.49945223 | 0 |
| 530.61704994 | 0 |
| 530.73465103 | 0 |
| 530.8522555 | 0 |
| 530.96986335 | 0 |
| 531.08747458 | 0 |
| 531.20508919 | 0 |
| 531.32270717 | 0 |
| 531.44032852 | 0 |
| 531.55795325 | 0 |
| 531.67558134 | 0 |
| 531.79321281 | 0 |
| 531.91084764 | 0 |
| 532.02848584 | 0 |
| 532.1461274 | 0 |
| 532.26377232 | 0 |
| 532.38142061 | 0 |
| 532.49907225 | 0 |
| 532.61672725 | 0 |
| 532.73438561 | 0 |
| 532.85204733 | 0 |
| 532.9697124 | 0 |
| 533.08738082 | 0 |
| 533.20505258 | 0 |
| 533.3227277 | 0 |
| 533.44040617 | 0 |
| 533.55808798 | 0 |
| 533.67577313 | 0 |
| 533.79346163 | 0 |
| 533.91115347 | 0 |
| 534.02884865 | 0 |
| 534.14654716 | 0 |
| 534.26424902 | 0 |
| 534.3819542 | 0 |
| 534.49966272 | 0 |
| 534.61737458 | 0 |
| 534.73508976 | 0 |
| 534.85280827 | 0 |
| 534.97053011 | 0 |
| 535.08825527 | 0 |
| 535.20598376 | 0 |
| 535.32371557 | 0 |
| 535.4414507 | 0 |
| 535.55918915 | 0 |
| 535.67693092 | 0 |
| 535.794676 | 0 |
| 535.9124244 | 0 |
| 536.03017612 | 0 |
| 536.14793114 | 0 |
| 536.26568948 | 0 |
| 536.38345112 | 0 |
| 536.50121607 | 0 |
| 536.61898432 | 0 |
| 536.73675588 | 0 |
| 536.85453075 | 0 |
| 536.97230891 | 0 |
| 537.09009037 | 0 |
| 537.20787513 | 0 |
| 537.32566319 | 0 |
| 537.44345454 | 0 |
| 537.56124918 | 0 |
| 537.67904712 | 0 |
| 537.79684835 | 0 |
| 537.91465286 | 0 |
| 538.03246066 | 0 |
| 538.15027175 | 0 |
| 538.26808612 | 0 |
| 538.38590377 | 0 |
| 538.50372471 | 0 |
| 538.62154892 | 0 |
| 538.73937641 | 0 |
| 538.85720718 | 0 |
| 538.97504122 | 0 |
| 539.09287854 | 0 |
| 539.21071912 | 0 |
| 539.32856298 | 0 |
| 539.44641011 | 0 |
| 539.5642605 | 0 |
| 539.68211416 | 0 |
| 539.79997108 | 0 |
| 539.91783126 | 0 |
| 540.03569471 | 0 |
| 540.15356141 | 0 |
| 540.27143137 | 0 |
| 540.38930459 | 0 |
| 540.50718106 | 0 |
| 540.62506079 | 0 |
| 540.74294377 | 0 |
| 540.86082999 | 0 |
| 540.97871947 | 0 |
| 541.09661219 | 0 |
| 541.21450816 | 0 |
| 541.33240737 | 0 |
| 541.45030983 | 0 |
| 541.56821552 | 0 |
| 541.68612445 | 0 |
| 541.80403663 | 0 |
| 541.92195203 | 0 |
| 542.03987068 | 0 |
| 542.15779255 | 0 |
| 542.27571766 | 0 |
| 542.393646 | 0 |
| 542.51157756 | 0 |
| 542.62951235 | 0 |
| 542.74745037 | 0 |
| 542.86539161 | 0 |
| 542.98333607 | 0 |
| 543.10128376 | 0 |
| 543.21923466 | 0 |
| 543.33718878 | 0 |
| 543.45514612 | 0 |
| 543.57310667 | 0 |
| 543.69107044 | 0 |
| 543.80903741 | 0 |
| 543.9270076 | 0 |
| 544.04498099 | 0 |
| 544.16295759 | 0 |
| 544.2809374 | 0 |
| 544.39892041 | 0 |
| 544.51690662 | 0 |
| 544.63489603 | 0 |
| 544.75288864 | 0 |
| 544.87088445 | 0 |
| 544.98888346 | 0 |
| 545.10688566 | 0 |
| 545.22489105 | 0 |
| 545.34289964 | 0 |
| 545.46091141 | 0 |
| 545.57892637 | 0 |
| 545.69694452 | 0 |
| 545.81496586 | 0 |
| 545.93299037 | 0 |
| 546.05101807 | 0 |
| 546.16904895 | 0 |
| 546.28708301 | 0 |
| 546.40512025 | 0 |
| 546.52316067 | 0 |
| 546.64120425 | 0 |
| 546.75925101 | 0 |
| 546.87730095 | 0 |
| 546.99535405 | 0 |
| 547.11341032 | 0 |
| 547.23146975 | 0 |
| 547.34953236 | 0 |
| 547.46759812 | 0 |
| 547.58566705 | 0 |
| 547.70373914 | 0 |
| 547.82181438 | 0 |
| 547.93989279 | 0 |
| 548.05797435 | 0 |
| 548.17605906 | 0 |
| 548.29414693 | 0 |
| 548.41223795 | 0 |
| 548.53033212 | 0 |
| 548.64842943 | 0 |
| 548.7665299 | 0 |
| 548.88463351 | 0 |
| 549.00274026 | 0 |
| 549.12085015 | 0 |
| 549.23896319 | 0 |
| 549.35707936 | 0 |
| 549.47519867 | 0 |
| 549.59332112 | 0 |
| 549.7114467 | 0 |
| 549.82957541 | 0 |
| 549.94770726 | 0 |
| 550.06584224 | 0 |
| 550.18398034 | 0 |
| 550.30212157 | 0 |
| 550.42026592 | 0 |
| 550.5384134 | 0 |
| 550.656564 | 0 |
| 550.77471772 | 0 |
| 550.89287456 | 0 |
| 551.01103452 | 0 |
| 551.12919759 | 0 |
| 551.24736378 | 0 |
| 551.36553308 | 0 |
| 551.48370549 | 0 |
| 551.60188101 | 0 |
| 551.72005964 | 0 |
| 551.83824137 | 0 |
| 551.95642621 | 0 |
| 552.07461416 | 0 |
| 552.1928052 | 0 |
| 552.31099935 | 0 |
| 552.42919659 | 0 |
| 552.54739694 | 0 |
| 552.66560038 | 0 |
| 552.78380691 | 0 |
| 552.90201653 | 0 |
| 553.02022925 | 0 |
| 553.13844505 | 0 |
| 553.25666395 | 0 |
| 553.37488593 | 0 |
| 553.49311099 | 0 |
| 553.61133914 | 0 |
| 553.72957037 | 0 |
| 553.84780468 | 0 |
| 553.96604207 | 0 |
| 554.08428254 | 0 |
| 554.20252608 | 0 |
| 554.3207727 | 0 |
| 554.43902239 | 0 |
| 554.55727515 | 0 |
| 554.67553098 | 0 |
| 554.79378988 | 0 |
| 554.91205184 | 0 |
| 555.03031687 | 0 |
| 555.14858496 | 0 |
| 555.26685612 | 0 |
| 555.38513033 | 0 |
| 555.50340761 | 0 |
| 555.62168794 | 0 |
| 555.73997132 | 0 |
| 555.85825777 | 0 |
| 555.97654726 | 0 |
| 556.0948398 | 0 |
| 556.2131354 | 0 |
| 556.33143404 | 0 |
| 556.44973573 | 0 |
| 556.56804046 | 0 |
| 556.68634824 | 0 |
| 556.80465905 | 0 |
| 556.92297291 | 0 |
| 557.04128981 | 0 |
| 557.15960974 | 0 |
| 557.27793271 | 0 |
| 557.39625872 | 0 |
| 557.51458775 | 0 |
| 557.63291982 | 0 |
| 557.75125492 | 0 |
| 557.86959304 | 0 |
| 557.98793419 | 0 |
| 558.10627837 | 0 |
| 558.22462557 | 0 |
| 558.34297579 | 0 |
| 558.46132903 | 0 |
| 558.57968529 | 0 |
| 558.69804457 | 0 |
| 558.81640686 | 0 |
| 558.93477217 | 0 |
| 559.05314049 | 0 |
| 559.17151182 | 0 |
| 559.28988615 | 0 |
| 559.4082635 | 0 |
| 559.52664386 | 0 |
| 559.64502721 | 0 |
| 559.76341358 | 0 |
| 559.88180294 | 0 |
| 560.0001953 | 0 |
| 560.11859066 | 0 |
| 560.23698902 | 0 |
| 560.35539038 | 0 |
| 560.47379472 | 0 |
| 560.59220207 | 0 |
| 560.7106124 | 0 |
| 560.82902572 | 0 |
| 560.94744203 | 0 |
| 561.06586132 | 0 |
| 561.1842836 | 0 |
| 561.30270887 | 0 |
| 561.42113711 | 0 |
| 561.53956833 | 0 |
| 561.65800254 | 0 |
| 561.77643972 | 0 |
| 561.89487987 | 0 |
| 562.013323 | 0 |
| 562.13176911 | 0 |
| 562.25021818 | 0 |
| 562.36867022 | 0 |
| 562.48712523 | 0 |
| 562.60558321 | 0 |
| 562.72404415 | 0 |
| 562.84250805 | 0 |
| 562.96097492 | 0 |
| 563.07944474 | 0 |
| 563.19791753 | 0 |
| 563.31639327 | 0 |
| 563.43487196 | 0 |
| 563.55335361 | 0 |
| 563.67183822 | 0 |
| 563.79032577 | 0 |
| 563.90881627 | 0 |
| 564.02730972 | 0 |
| 564.14580612 | 0 |
| 564.26430546 | 0 |
| 564.38280774 | 0 |
| 564.50131297 | 0 |
| 564.61982114 | 0 |
| 564.73833224 | 0 |
| 564.85684628 | 0 |
| 564.97536326 | 0 |
| 565.09388317 | 0 |
| 565.21240601 | 0 |
| 565.33093178 | 0 |
| 565.44946049 | 0 |
| 565.56799212 | 0 |
| 565.68652667 | 0 |
| 565.80506415 | 0 |
| 565.92360456 | 0 |
| 566.04214788 | 0 |
| 566.16069413 | 0 |
| 566.27924329 | 0 |
| 566.39779537 | 0 |
| 566.51635037 | 0 |
| 566.63490828 | 0 |
| 566.7534691 | 0 |
| 566.87203283 | 0 |
| 566.99059947 | 0 |
| 567.10916902 | 0 |
| 567.22774148 | 0 |
| 567.34631684 | 0 |
| 567.4648951 | 0 |
| 567.58347626 | 0 |
| 567.70206033 | 0 |
| 567.82064729 | 0 |
| 567.93923715 | 0 |
| 568.0578299 | 0 |
| 568.17642555 | 0 |
| 568.29502409 | 0 |
| 568.41362552 | 0 |
| 568.53222984 | 0 |
| 568.65083705 | 0 |
| 568.76944715 | 0 |
| 568.88806012 | 0 |
| 569.00667599 | 0 |
| 569.12529473 | 0 |
| 569.24391635 | 0 |
| 569.36254085 | 0 |
| 569.48116823 | 0 |
| 569.59979848 | 0 |
| 569.71843161 | 0 |
| 569.83706761 | 0 |
| 569.95570647 | 0 |
| 570.07434821 | 0 |
| 570.19299282 | 0 |
| 570.31164029 | 0 |
| 570.43029063 | 0 |
| 570.54894382 | 0 |
| 570.66759988 | 0 |
| 570.7862588 | 0 |
| 570.90492058 | 0 |
| 571.02358522 | 0 |
| 571.14225271 | 0 |
| 571.26092305 | 0 |
| 571.37959625 | 0 |
| 571.49827229 | 0 |
| 571.61695119 | 0 |
| 571.73563293 | 0 |
| 571.85431752 | 0 |
| 571.97300495 | 0 |
| 572.09169523 | 0 |
| 572.21038834 | 0 |
| 572.3290843 | 0 |
| 572.4477831 | 0 |
| 572.56648473 | 0 |
| 572.68518919 | 0 |
| 572.80389649 | 0 |
| 572.92260663 | 0 |
| 573.04131959 | 0 |
| 573.16003538 | 0 |
| 573.278754 | 0 |
| 573.39747545 | 0 |
| 573.51619972 | 0 |
| 573.63492681 | 0 |
| 573.75365672 | 0 |
| 573.87238945 | 0 |
| 573.99112501 | 0 |
| 574.10986337 | 0 |
| 574.22860456 | 0 |
| 574.34734855 | 0 |
| 574.46609536 | 0 |
| 574.58484498 | 0 |
| 574.70359741 | 0 |
| 574.82235264 | 0 |
| 574.94111068 | 0 |
| 575.05987153 | 0 |
| 575.17863518 | 0 |
| 575.29740162 | 0 |
| 575.41617087 | 0 |
| 575.53494292 | 0 |
| 575.65371776 | 0 |
| 575.7724954 | 0 |
| 575.89127583 | 0 |
| 576.01005906 | 0 |
| 576.12884507 | 0 |
| 576.24763387 | 0 |
| 576.36642546 | 0 |
| 576.48521984 | 0 |
| 576.604017 | 0 |
| 576.72281694 | 0 |
| 576.84161967 | 0 |
| 576.96042517 | 0 |
| 577.07923345 | 0 |
| 577.19804451 | 0 |
| 577.31685834 | 0 |
| 577.43567495 | 0 |
| 577.55449433 | 0 |
| 577.67331648 | 0 |
| 577.7921414 | 0 |
| 577.91096908 | 0 |
| 578.02979953 | 0 |
| 578.14863275 | 0 |
| 578.26746872 | 0 |
| 578.38630746 | 0 |
| 578.50514896 | 0 |
| 578.62399322 | 0 |
| 578.74284023 | 0 |
| 578.86168999 | 0 |
| 578.98054252 | 0 |
| 579.09939779 | 0 |
| 579.21825581 | 0 |
| 579.33711658 | 0 |
| 579.4559801 | 0 |
| 579.57484637 | 0 |
| 579.69371537 | 0 |
| 579.81258712 | 0 |
| 579.93146162 | 0 |
| 580.05033885 | 0 |
| 580.16921882 | 0 |
| 580.28810152 | 0 |
| 580.40698696 | 0 |
| 580.52587514 | 0 |
| 580.64476604 | 0 |
| 580.76365968 | 0 |
| 580.88255605 | 0 |
| 581.00145514 | 0 |
| 581.12035696 | 0 |
| 581.2392615 | 0 |
| 581.35816876 | 0 |
| 581.47707875 | 0 |
| 581.59599145 | 0 |
| 581.71490687 | 0 |
| 581.83382501 | 0 |
| 581.95274587 | 0 |
| 582.07166943 | 0 |
| 582.19059571 | 0 |
| 582.3095247 | 0 |
| 582.4284564 | 0 |
| 582.5473908 | 0 |
| 582.66632791 | 0 |
| 582.78526773 | 0 |
| 582.90421024 | 0 |
| 583.02315546 | 0 |
| 583.14210338 | 0 |
| 583.26105399 | 0 |
| 583.3800073 | 0 |
| 583.49896331 | 0 |
| 583.61792201 | 0 |
| 583.7368834 | 0 |
| 583.85584748 | 0 |
| 583.97481425 | 0 |
| 584.09378371 | 0 |
| 584.21275585 | 0 |
| 584.33173067 | 0 |
| 584.45070818 | 0 |
| 584.56968837 | 0 |
| 584.68867124 | 0 |
| 584.80765679 | 0 |
| 584.92664501 | 0 |
| 585.04563591 | 0 |
| 585.16462948 | 0 |
| 585.28362572 | 0 |
| 585.40262463 | 0 |
| 585.52162621 | 0 |
| 585.64063046 | 0 |
| 585.75963737 | 0 |
| 585.87864695 | 0 |
| 585.99765919 | 0 |
| 586.11667409 | 0 |
| 586.23569165 | 0 |
| 586.35471187 | 0 |
| 586.47373474 | 0 |
| 586.59276027 | 0 |
| 586.71178845 | 0 |
| 586.83081928 | 0 |
| 586.94985277 | 0 |
| 587.0688889 | 0 |
| 587.18792768 | 0 |
| 587.3069691 | 0 |
| 587.42601317 | 0 |
| 587.54505988 | 0 |
| 587.66410923 | 0 |
| 587.78316122 | 0 |
| 587.90221585 | 0 |
| 588.02127311 | 0 |
| 588.14033301 | 0 |
| 588.25939554 | 0 |
| 588.37846071 | 0 |
| 588.4975285 | 0 |
| 588.61659892 | 0 |
| 588.73567197 | 0 |
| 588.85474764 | 0 |
| 588.97382594 | 0 |
| 589.09290686 | 0 |
| 589.2119904 | 0 |
| 589.33107656 | 0 |
| 589.45016534 | 0 |
| 589.56925673 | 0 |
| 589.68835074 | 0 |
| 589.80744736 | 0 |
| 589.92654659 | 0 |
| 590.04564844 | 0 |
| 590.16475289 | 0 |
| 590.28385994 | 0 |
| 590.40296961 | 0 |
| 590.52208187 | 0 |
| 590.64119674 | 0 |
| 590.76031421 | 0 |
| 590.87943428 | 0 |
| 590.99855695 | 0 |
| 591.11768221 | 0 |
| 591.23681007 | 0 |
| 591.35594052 | 0 |
| 591.47507356 | 0 |
| 591.59420919 | 0 |
| 591.71334741 | 0 |
| 591.83248822 | 0 |
| 591.95163161 | 0 |
| 592.07077758 | 0 |
| 592.18992614 | 0 |
| 592.30907728 | 0 |
| 592.428231 | 0 |
| 592.54738729 | 0 |
| 592.66654616 | 0 |
| 592.78570761 | 0 |
| 592.90487163 | 0 |
| 593.02403822 | 0 |
| 593.14320738 | 0 |
| 593.2623791 | 0 |
| 593.3815534 | 0 |
| 593.50073026 | 0 |
| 593.61990968 | 0 |
| 593.73909167 | 0 |
| 593.85827621 | 0 |
| 593.97746332 | 0 |
| 594.09665298 | 0 |
| 594.2158452 | 0 |
| 594.33503997 | 0 |
| 594.4542373 | 0 |
| 594.57343718 | 0 |
| 594.6926396 | 0 |
| 594.81184458 | 0 |
| 594.9310521 | 0 |
| 595.05026217 | 0 |
| 595.16947478 | 0 |
| 595.28868993 | 0 |
| 595.40790762 | 0 |
| 595.52712786 | 0 |
| 595.64635063 | 0 |
| 595.76557593 | 0 |
| 595.88480377 | 0 |
| 596.00403415 | 0 |
| 596.12326705 | 0 |
| 596.24250248 | 0 |
| 596.36174045 | 0 |
| 596.48098093 | 0 |
| 596.60022395 | 0 |
| 596.71946949 | 0 |
| 596.83871754 | 0 |
| 596.95796812 | 0 |
| 597.07722122 | 0 |
| 597.19647684 | 0 |
| 597.31573497 | 0 |
| 597.43499562 | 0 |
| 597.55425878 | 0 |
| 597.67352445 | 0 |
| 597.79279263 | 0 |
| 597.91206332 | 0 |
| 598.03133651 | 0 |
| 598.15061221 | 0 |
| 598.26989041 | 0 |
| 598.38917112 | 0 |
| 598.50845432 | 0 |
| 598.62774003 | 0 |
| 598.74702823 | 0 |
| 598.86631893 | 0 |
| 598.98561212 | 0 |
| 599.10490781 | 0 |
| 599.22420598 | 0 |
| 599.34350665 | 0 |
| 599.4628098 | 0 |
| 599.58211544 | 0 |
| 599.70142357 | 0 |
| 599.82073418 | 0 |
| 599.94004727 | 0 |
| 600.05936284 | 0 |
| 600.17868089 | 0 |
| 600.29800141 | 0 |
| 600.41732442 | 0 |
| 600.53664989 | 0 |
| 600.65597784 | 0 |
| 600.77530826 | 0 |
| 600.89464115 | 0 |
| 601.01397651 | 0 |
| 601.13331434 | 0 |
| 601.25265463 | 0 |
| 601.37199738 | 0 |
| 601.4913426 | 0 |
| 601.61069027 | 0 |
| 601.73004041 | 0 |
| 601.849393 | 0 |
| 601.96874805 | 0 |
| 602.08810555 | 0 |
| 602.2074655 | 0 |
| 602.32682791 | 0 |
| 602.44619276 | 0 |
| 602.56556006 | 0 |
| 602.68492981 | 0 |
| 602.80430201 | 0 |
| 602.92367664 | 0 |
| 603.04305372 | 0 |
| 603.16243324 | 0 |
| 603.2818152 | 0 |
| 603.4011996 | 0 |
| 603.52058643 | 0 |
| 603.63997569 | 0 |
| 603.75936739 | 0 |
| 603.87876152 | 0 |
| 603.99815808 | 0 |
| 604.11755706 | 0 |
| 604.23695848 | 0 |
| 604.35636231 | 0 |
| 604.47576857 | 0 |
| 604.59517726 | 0 |
| 604.71458836 | 0 |
| 604.83400188 | 0 |
| 604.95341782 | 0 |
| 605.07283617 | 0 |
| 605.19225694 | 0 |
| 605.31168012 | 0 |
| 605.43110572 | 0 |
| 605.55053372 | 0 |
| 605.66996413 | 0 |
| 605.78939694 | 0 |
| 605.90883216 | 0 |
| 606.02826979 | 0 |
| 606.14770981 | 0 |
| 606.26715224 | 0 |
| 606.38659706 | 0 |
| 606.50604428 | 0 |
| 606.6254939 | 0 |
| 606.74494591 | 0 |
| 606.86440031 | 0 |
| 606.98385711 | 0 |
| 607.10331629 | 0 |
| 607.22277786 | 0 |
| 607.34224182 | 0 |
| 607.46170816 | 0 |
| 607.58117689 | 0 |
| 607.70064799 | 0 |
| 607.82012148 | 0 |
| 607.93959735 | 0 |
| 608.05907559 | 0 |
| 608.17855621 | 0 |
| 608.2980392 | 0 |
| 608.41752457 | 0 |
| 608.5370123 | 0 |
| 608.65650241 | 0 |
| 608.77599488 | 0 |
| 608.89548972 | 0 |
| 609.01498692 | 0 |
| 609.13448649 | 0 |
| 609.25398842 | 0 |
| 609.37349271 | 0 |
| 609.49299935 | 0 |
| 609.61250836 | 0 |
| 609.73201972 | 0 |
| 609.85153343 | 0 |
| 609.9710495 | 0 |
| 610.09056791 | 0 |
| 610.21008868 | 0 |
| 610.32961179 | 0 |
| 610.44913725 | 0 |
| 610.56866506 | 0 |
| 610.68819521 | 0 |
| 610.8077277 | 0 |
| 610.92726253 | 0 |
| 611.04679969 | 0 |
| 611.1663392 | 0 |
| 611.28588104 | 0 |
| 611.40542521 | 0 |
| 611.52497172 | 0 |
| 611.64452056 | 0 |
| 611.76407172 | 0 |
| 611.88362522 | 0 |
| 612.00318104 | 0 |
| 612.12273918 | 0 |
| 612.24229965 | 0 |
| 612.36186244 | 0 |
| 612.48142755 | 0 |
| 612.60099498 | 0 |
| 612.72056472 | 0 |
| 612.84013678 | 0 |
| 612.95971116 | 0 |
| 613.07928784 | 0 |
| 613.19886684 | 0 |
| 613.31844815 | 0 |
| 613.43803176 | 0 |
| 613.55761768 | 0 |
| 613.6772059 | 0 |
| 613.79679643 | 0 |
| 613.91638926 | 0 |
| 614.03598439 | 0 |
| 614.15558182 | 0 |
| 614.27518154 | 0 |
| 614.39478356 | 0 |
| 614.51438787 | 0 |
| 614.63399448 | 0 |
| 614.75360337 | 0 |
| 614.87321456 | 0 |
| 614.99282803 | 0 |
| 615.11244379 | 0 |
| 615.23206183 | 0 |
| 615.35168216 | 0 |
| 615.47130477 | 0 |
| 615.59092966 | 0 |
| 615.71055682 | 0 |
| 615.83018626 | 0 |
| 615.94981798 | 0 |
| 616.06945197 | 0 |
| 616.18908824 | 0 |
| 616.30872677 | 0 |
| 616.42836758 | 0 |
| 616.54801065 | 0 |
| 616.66765598 | 0 |
| 616.78730358 | 0 |
| 616.90695345 | 0 |
| 617.02660557 | 0 |
| 617.14625996 | 0 |
| 617.2659166 | 0 |
| 617.38557551 | 0 |
| 617.50523666 | 0 |
| 617.62490007 | 0 |
| 617.74456573 | 0 |
| 617.86423364 | 0 |
| 617.98390381 | 0 |
| 618.10357621 | 0 |
| 618.22325087 | 0 |
| 618.34292777 | 0 |
| 618.46260691 | 0 |
| 618.58228829 | 0 |
| 618.70197192 | 0 |
| 618.82165778 | 0 |
| 618.94134588 | 0 |
| 619.06103621 | 0 |
| 619.18072878 | 0 |
| 619.30042357 | 0 |
| 619.4201206 | 0 |
| 619.53981986 | 0 |
| 619.65952135 | 0 |
| 619.77922506 | 0 |
| 619.898931 | 0 |
| 620.01863915 | 0 |
| 620.13834953 | 0 |
| 620.25806213 | 0 |
| 620.37777695 | 0 |
| 620.49749399 | 0 |
| 620.61721324 | 0 |
| 620.7369347 | 0 |
| 620.85665837 | 0 |
| 620.97638426 | 0 |
| 621.09611236 | 0 |
| 621.21584266 | 0 |
| 621.33557517 | 0 |
| 621.45530988 | 0 |
| 621.57504679 | 0 |
| 621.69478591 | 0 |
| 621.81452723 | 0 |
| 621.93427074 | 0 |
| 622.05401645 | 0 |
| 622.17376436 | 0 |
| 622.29351445 | 0 |
| 622.41326675 | 0 |
| 622.53302123 | 0 |
| 622.6527779 | 0 |
| 622.77253676 | 0 |
| 622.8922978 | 0 |
| 623.01206103 | 0 |
| 623.13182644 | 0 |
| 623.25159403 | 0 |
| 623.3713638 | 0 |
| 623.49113575 | 0 |
| 623.61090988 | 0 |
| 623.73068618 | 0 |
| 623.85046465 | 0 |
| 623.9702453 | 0 |
| 624.09002812 | 0 |
| 624.2098131 | 0 |
| 624.32960025 | 0 |
| 624.44938957 | 0 |
| 624.56918106 | 0 |
| 624.6889747 | 0 |
| 624.80877051 | 0 |
| 624.92856847 | 0 |
| 625.0483686 | 0 |
| 625.16817088 | 0 |
| 625.28797531 | 0 |
| 625.4077819 | 0 |
| 625.52759064 | 0 |
| 625.64740154 | 0 |
| 625.76721458 | 0 |
| 625.88702976 | 0 |
| 626.0068471 | 0 |
| 626.12666657 | 0 |
| 626.24648819 | 0 |
| 626.36631195 | 0 |
| 626.48613785 | 0 |
| 626.60596589 | 0 |
| 626.72579607 | 0 |
| 626.84562838 | 0 |
| 626.96546282 | 0 |
| 627.0852994 | 0 |
| 627.2051381 | 0 |
| 627.32497893 | 0 |
| 627.4448219 | 0 |
| 627.56466698 | 0 |
| 627.68451419 | 0 |
| 627.80436353 | 0 |
| 627.92421498 | 0 |
| 628.04406855 | 0 |
| 628.16392425 | 0 |
| 628.28378205 | 0 |
| 628.40364198 | 0 |
| 628.52350401 | 0 |
| 628.64336816 | 0 |
| 628.76323442 | 0 |
| 628.88310279 | 0 |
| 629.00297326 | 0 |
| 629.12284584 | 0 |
| 629.24272053 | 0 |
| 629.36259731 | 0 |
| 629.4824762 | 0 |
| 629.60235719 | 0 |
| 629.72224027 | 0 |
| 629.84212545 | 0 |
| 629.96201273 | 0 |
| 630.0819021 | 0 |
| 630.20179356 | 0 |
| 630.32168711 | 0 |
| 630.44158275 | 0 |
| 630.56148047 | 0 |
| 630.68138029 | 0 |
| 630.80128218 | 0 |
| 630.92118616 | 0 |
| 631.04109222 | 0 |
| 631.16100036 | 0 |
| 631.28091058 | 0 |
| 631.40082287 | 0 |
| 631.52073724 | 0 |
| 631.64065368 | 0 |
| 631.76057219 | 0 |
| 631.88049277 | 0 |
| 632.00041543 | 0 |
| 632.12034014 | 0 |
| 632.24026693 | 0 |
| 632.36019578 | 0 |
| 632.48012669 | 0 |
| 632.60005966 | 0 |
| 632.71999469 | 0 |
| 632.83993178 | 0 |
| 632.95987092 | 0 |
| 633.07981212 | 0 |
| 633.19975537 | 0 |
| 633.31970068 | 0 |
| 633.43964803 | 0 |
| 633.55959743 | 0 |
| 633.67954888 | 0 |
| 633.79950238 | 0 |
| 633.91945792 | 0 |
| 634.0394155 | 0 |
| 634.15937512 | 0 |
| 634.27933678 | 0 |
| 634.39930048 | 0 |
| 634.51926622 | 0 |
| 634.63923399 | 0 |
| 634.75920379 | 0 |
| 634.87917562 | 0 |
| 634.99914949 | 0 |
| 635.11912538 | 0 |
| 635.2391033 | 0 |
| 635.35908325 | 0 |
| 635.47906522 | 0 |
| 635.59904921 | 0 |
| 635.71903522 | 0 |
| 635.83902325 | 0 |
| 635.9590133 | 0 |
| 636.07900537 | 0 |
| 636.19899945 | 0 |
| 636.31899554 | 0 |
| 636.43899365 | 0 |
| 636.55899376 | 0 |
| 636.67899588 | 0 |
| 636.79900001 | 0 |
| 636.91900615 | 0 |
| 637.03901429 | 0 |
| 637.15902443 | 0 |
| 637.27903657 | 0 |
| 637.39905071 | 0 |
| 637.51906685 | 0 |
| 637.63908499 | 0 |
| 637.75910512 | 0 |
| 637.87912724 | 0 |
| 637.99915135 | 0 |
| 638.11917746 | 0 |
| 638.23920555 | 0 |
| 638.35923563 | 0 |
| 638.47926769 | 0 |
| 638.59930174 | 0 |
| 638.71933777 | 0 |
| 638.83937578 | 0 |
| 638.95941577 | 0 |
| 639.07945774 | 0 |
| 639.19950169 | 0 |
| 639.3195476 | 0 |
| 639.4395955 | 0 |
| 639.55964536 | 0 |
| 639.67969719 | 0 |
| 639.79975099 | 0 |
| 639.91980676 | 0 |
| 640.03986449 | 0 |
| 640.15992419 | 0 |
| 640.27998585 | 0 |
| 640.40004947 | 0 |
| 640.52011505 | 0 |
| 640.64018258 | 0 |
| 640.76025207 | 0 |
| 640.88032352 | 0 |
| 641.00039692 | 0 |
| 641.12047227 | 0 |
| 641.24054957 | 0 |
| 641.36062882 | 0 |
| 641.48071002 | 0 |
| 641.60079316 | 0 |
| 641.72087824 | 0 |
| 641.84096527 | 0 |
| 641.96105424 | 0 |
| 642.08114514 | 0 |
| 642.20123799 | 0 |
| 642.32133276 | 0 |
| 642.44142948 | 0 |
| 642.56152813 | 0 |
| 642.6816287 | 0 |
| 642.80173121 | 0 |
| 642.92183565 | 0 |
| 643.04194201 | 0 |
| 643.1620503 | 0 |
| 643.28216051 | 0 |
| 643.40227264 | 0 |
| 643.5223867 | 0 |
| 643.64250267 | 0 |
| 643.76262056 | 0 |
| 643.88274037 | 0 |
| 644.00286209 | 0 |
| 644.12298572 | 0 |
| 644.24311127 | 0 |
| 644.36323872 | 0 |
| 644.48336809 | 0 |
| 644.60349936 | 0 |
| 644.72363253 | 0 |
| 644.84376761 | 0 |
| 644.96390459 | 0 |
| 645.08404347 | 0 |
| 645.20418425 | 0 |
| 645.32432693 | 0 |
| 645.4444715 | 0 |
| 645.56461797 | 0 |
| 645.68476633 | 0 |
| 645.80491658 | 0 |
| 645.92506872 | 0 |
| 646.04522275 | 0 |
| 646.16537866 | 0 |
| 646.28553646 | 0 |
| 646.40569615 | 0 |
| 646.52585771 | 0 |
| 646.64602116 | 0 |
| 646.76618648 | 0 |
| 646.88635369 | 0 |
| 647.00652276 | 0 |
| 647.12669372 | 0 |
| 647.24686654 | 0 |
| 647.36704124 | 0 |
| 647.48721781 | 0 |
| 647.60739624 | 0 |
| 647.72757654 | 0 |
| 647.84775871 | 0 |
| 647.96794274 | 0 |
| 648.08812863 | 0 |
| 648.20831638 | 0 |
| 648.32850599 | 0 |
| 648.44869746 | 0 |
| 648.56889078 | 0 |
| 648.68908596 | 0 |
| 648.80928299 | 0 |
| 648.92948187 | 0 |
| 649.0496826 | 0 |
| 649.16988518 | 0 |
| 649.2900896 | 0 |
| 649.41029587 | 0 |
| 649.53050399 | 0 |
| 649.65071394 | 0 |
| 649.77092574 | 0 |
| 649.89113937 | 0 |
| 650.01135485 | 0 |
| 650.13157215 | 0 |
| 650.2517913 | 0 |
| 650.37201227 | 0 |
| 650.49223507 | 0 |
| 650.61245971 | 0 |
| 650.73268617 | 0 |
| 650.85291446 | 0 |
| 650.97314458 | 0 |
| 651.09337651 | 0 |
| 651.21361027 | 0 |
| 651.33384585 | 0 |
| 651.45408325 | 0 |
| 651.57432247 | 0 |
| 651.6945635 | 0 |
| 651.81480634 | 0 |
| 651.935051 | 0 |
| 652.05529747 | 0 |
| 652.17554575 | 0 |
| 652.29579584 | 0 |
| 652.41604773 | 0 |
| 652.53630143 | 0 |
| 652.65655693 | 0 |
| 652.77681423 | 0 |
| 652.89707333 | 0 |
| 653.01733423 | 0 |
| 653.13759693 | 0 |
| 653.25786143 | 0 |
| 653.37812772 | 0 |
| 653.4983958 | 0 |
| 653.61866567 | 0 |
| 653.73893733 | 0 |
| 653.85921078 | 0 |
| 653.97948601 | 0 |
| 654.09976303 | 0 |
| 654.22004184 | 0 |
| 654.34032242 | 0 |
| 654.46060479 | 0 |
| 654.58088893 | 0 |
| 654.70117485 | 0 |
| 654.82146255 | 0 |
| 654.94175202 | 0 |
| 655.06204326 | 0 |
| 655.18233628 | 0 |
| 655.30263106 | 0 |
| 655.42292761 | 0 |
| 655.54322593 | 0 |
| 655.66352601 | 0 |
| 655.78382786 | 0 |
| 655.90413146 | 0 |
| 656.02443683 | 0 |
| 656.14474396 | 0 |
| 656.26505284 | 0 |
| 656.38536348 | 0 |
| 656.50567587 | 0 |
| 656.62599001 | 0 |
| 656.74630591 | 0 |
| 656.86662356 | 0 |
| 656.98694295 | 0 |
| 657.10726409 | 0 |
| 657.22758697 | 0 |
| 657.3479116 | 0 |
| 657.46823797 | 0 |
| 657.58856607 | 0 |
| 657.70889592 | 0 |
| 657.8292275 | 0 |
| 657.94956082 | 0 |
| 658.06989588 | 0 |
| 658.19023266 | 0 |
| 658.31057118 | 0 |
| 658.43091142 | 0 |
| 658.5512534 | 0 |
| 658.6715971 | 0 |
| 658.79194252 | 0 |
| 658.91228967 | 0 |
| 659.03263854 | 0 |
| 659.15298913 | 0 |
| 659.27334143 | 0 |
| 659.39369546 | 0 |
| 659.5140512 | 0 |
| 659.63440865 | 0 |
| 659.75476782 | 0 |
| 659.87512869 | 0 |
| 659.99549128 | 0 |
| 660.11585557 | 0 |
| 660.23622157 | 0 |
| 660.35658928 | 0 |
| 660.47695869 | 0 |
| 660.59732979 | 0 |
| 660.7177026 | 0 |
| 660.83807711 | 0 |
| 660.95845331 | 0 |
| 661.07883121 | 0 |
| 661.19921081 | 0 |
| 661.31959209 | 0 |
| 661.43997507 | 0 |
| 661.56035973 | 0 |
| 661.68074609 | 0 |
| 661.80113413 | 0 |
| 661.92152385 | 0 |
| 662.04191526 | 0 |
| 662.16230834 | 0 |
| 662.28270311 | 0 |
| 662.40309956 | 0 |
| 662.52349768 | 0 |
| 662.64389748 | 0 |
| 662.76429895 | 0 |
| 662.8847021 | 0 |
| 663.00510691 | 0 |
| 663.1255134 | 0 |
| 663.24592155 | 0 |
| 663.36633137 | 0 |
| 663.48674285 | 0 |
| 663.60715599 | 0 |
| 663.7275708 | 0 |
| 663.84798727 | 0 |
| 663.96840539 | 0 |
| 664.08882517 | 0 |
| 664.20924661 | 0 |
| 664.3296697 | 0 |
| 664.45009445 | 0 |
| 664.57052084 | 0 |
| 664.69094888 | 0 |
| 664.81137857 | 0 |
| 664.93180991 | 0 |
| 665.05224289 | 0 |
| 665.17267751 | 0 |
| 665.29311378 | 0 |
| 665.41355168 | 0 |
| 665.53399122 | 0 |
| 665.6544324 | 0 |
| 665.77487522 | 0 |
| 665.89531967 | 0 |
| 666.01576575 | 0 |
| 666.13621346 | 0 |
| 666.2566628 | 0 |
| 666.37711377 | 0 |
| 666.49756636 | 0 |
| 666.61802058 | 0 |
| 666.73847642 | 0 |
| 666.85893388 | 0 |
| 666.97939296 | 0 |
| 667.09985366 | 0 |
| 667.22031598 | 0 |
| 667.34077991 | 0 |
| 667.46124546 | 0 |
| 667.58171261 | 0 |
| 667.70218138 | 0 |
| 667.82265176 | 0 |
| 667.94312374 | 0 |
| 668.06359733 | 0 |
| 668.18407253 | 0 |
| 668.30454933 | 0 |
| 668.42502772 | 0 |
| 668.54550772 | 0 |
| 668.66598932 | 0 |
| 668.78647251 | 0 |
| 668.9069573 | 0 |
| 669.02744368 | 0 |
| 669.14793166 | 0 |
| 669.26842122 | 0 |
| 669.38891237 | 0 |
| 669.50940511 | 0 |
| 669.62989944 | 0 |
| 669.75039535 | 0 |
| 669.87089285 | 0 |
| 669.99139192 | 0 |
| 670.11189257 | 0 |
| 670.23239481 | 0 |
| 670.35289862 | 0 |
| 670.473404 | 0 |
| 670.59391096 | 0 |
| 670.71441949 | 0 |
| 670.83492959 | 0 |
| 670.95544126 | 0 |
| 671.07595449 | 0 |
| 671.1964693 | 0 |
| 671.31698566 | 0 |
| 671.43750359 | 0 |
| 671.55802308 | 0 |
| 671.67854413 | 0 |
| 671.79906674 | 0 |
| 671.9195909 | 0 |
| 672.04011662 | 0 |
| 672.1606439 | 0 |
| 672.28117272 | 0 |
| 672.40170309 | 0 |
| 672.52223502 | 0 |
| 672.64276849 | 0 |
| 672.76330351 | 0 |
| 672.88384007 | 0 |
| 673.00437817 | 0 |
| 673.12491782 | 0 |
| 673.245459 | 0 |
| 673.36600172 | 0 |
| 673.48654598 | 0 |
| 673.60709178 | 0 |
| 673.7276391 | 0 |
| 673.84818796 | 0 |
| 673.96873835 | 0 |
| 674.08929027 | 0 |
| 674.20984372 | 0 |
| 674.33039869 | 0 |
| 674.45095518 | 0 |
| 674.5715132 | 0 |
| 674.69207274 | 0 |
| 674.8126338 | 0 |
| 674.93319637 | 0 |
| 675.05376047 | 0 |
| 675.17432607 | 0 |
| 675.2948932 | 0 |
| 675.41546183 | 0 |
| 675.53603197 | 0 |
| 675.65660362 | 0 |
| 675.77717678 | 0 |
| 675.89775145 | 0 |
| 676.01832762 | 0 |
| 676.13890529 | 0 |
| 676.25948446 | 0 |
| 676.38006513 | 0 |
| 676.5006473 | 0 |
| 676.62123097 | 0 |
| 676.74181613 | 0 |
| 676.86240278 | 0 |
| 676.98299093 | 0 |
| 677.10358057 | 0 |
| 677.22417169 | 0 |
| 677.3447643 | 0 |
| 677.4653584 | 0 |
| 677.58595398 | 0 |
| 677.70655105 | 0 |
| 677.82714959 | 0 |
| 677.94774962 | 0 |
| 678.06835112 | 0 |
| 678.1889541 | 0 |
| 678.30955855 | 0 |
| 678.43016448 | 0 |
| 678.55077188 | 0 |
| 678.67138074 | 0 |
| 678.79199108 | 0 |
| 678.91260289 | 0 |
| 679.03321616 | 0 |
| 679.15383089 | 0 |
| 679.27444709 | 0 |
| 679.39506474 | 0 |
| 679.51568386 | 0 |
| 679.63630443 | 0 |
| 679.75692647 | 0 |
| 679.87754995 | 0 |
| 679.99817489 | 0 |
| 680.11880128 | 0 |
| 680.23942912 | 0 |
| 680.36005841 | 0 |
| 680.48068915 | 0 |
| 680.60132133 | 0 |
| 680.72195495 | 0 |
| 680.84259002 | 0 |
| 680.96322653 | 0 |
| 681.08386448 | 0 |
| 681.20450386 | 0 |
| 681.32514469 | 0 |
| 681.44578694 | 0 |
| 681.56643063 | 0 |
| 681.68707575 | 0 |
| 681.8077223 | 0 |
| 681.92837028 | 0 |
| 682.04901969 | 0 |
| 682.16967052 | 0 |
| 682.29032278 | 0 |
| 682.41097646 | 0 |
| 682.53163156 | 0 |
| 682.65228808 | 0 |
| 682.77294601 | 0 |
| 682.89360537 | 0 |
| 683.01426613 | 0 |
| 683.13492832 | 0 |
| 683.25559191 | 0 |
| 683.37625691 | 0 |
| 683.49692332 | 0 |
| 683.61759114 | 0 |
| 683.73826036 | 0 |
| 683.85893099 | 0 |
| 683.97960302 | 0 |
| 684.10027645 | 0 |
| 684.22095127 | 0 |
| 684.3416275 | 0 |
| 684.46230512 | 0 |
| 684.58298414 | 0 |
| 684.70366455 | 0 |
| 684.82434635 | 0 |
| 684.94502954 | 0 |
| 685.06571413 | 0 |
| 685.18640009 | 0 |
| 685.30708744 | 0 |
| 685.42777618 | 0 |
| 685.5484663 | 0 |
| 685.6691578 | 0 |
| 685.78985068 | 0 |
| 685.91054493 | 0 |
| 686.03124057 | 0 |
| 686.15193757 | 0 |
| 686.27263595 | 0 |
| 686.3933357 | 0 |
| 686.51403682 | 0 |
| 686.63473931 | 0 |
| 686.75544317 | 0 |
| 686.87614839 | 0 |
| 686.99685498 | 0 |
| 687.11756292 | 0 |
| 687.23827223 | 0 |
| 687.3589829 | 0 |
| 687.47969492 | 0 |
| 687.6004083 | 0 |
| 687.72112304 | 0 |
| 687.84183913 | 0 |
| 687.96255657 | 0 |
| 688.08327536 | 0 |
| 688.2039955 | 0 |
| 688.32471698 | 0 |
| 688.44543981 | 0 |
| 688.56616398 | 0 |
| 688.6868895 | 0 |
| 688.80761636 | 0 |
| 688.92834455 | 0 |
| 689.04907408 | 0 |
| 689.16980495 | 0 |
| 689.29053716 | 0 |
| 689.41127069 | 0 |
| 689.53200556 | 0 |
| 689.65274176 | 0 |
| 689.77347928 | 0 |
| 689.89421813 | 0 |
| 690.01495831 | 0 |
| 690.13569981 | 0 |
| 690.25644264 | 0 |
| 690.37718678 | 0 |
| 690.49793224 | 0 |
| 690.61867902 | 0 |
| 690.73942712 | 0 |
| 690.86017653 | 0 |
| 690.98092725 | 0 |
| 691.10167929 | 0 |
| 691.22243263 | 0 |
| 691.34318729 | 0 |
| 691.46394325 | 0 |
| 691.58470051 | 0 |
| 691.70545908 | 0 |
| 691.82621895 | 0 |
| 691.94698012 | 0 |
| 692.06774259 | 0 |
| 692.18850636 | 0 |
| 692.30927142 | 0 |
| 692.43003778 | 0 |
| 692.55080543 | 0 |
| 692.67157437 | 0 |
| 692.7923446 | 0 |
| 692.91311612 | 0 |
| 693.03388893 | 0 |
| 693.15466302 | 0 |
| 693.27543839 | 0 |
| 693.39621505 | 0 |
| 693.51699298 | 0 |
| 693.6377722 | 0 |
| 693.75855269 | 0 |
| 693.87933446 | 0 |
| 694.00011751 | 0 |
| 694.12090182 | 0 |
| 694.24168741 | 0 |
| 694.36247427 | 0 |
| 694.48326239 | 0 |
| 694.60405178 | 0 |
| 694.72484244 | 0 |
| 694.84563436 | 0 |
| 694.96642754 | 0 |
| 695.08722199 | 0 |
| 695.20801769 | 0 |
| 695.32881465 | 0 |
| 695.44961286 | 0 |
| 695.57041233 | 0 |
| 695.69121305 | 0 |
| 695.81201502 | 0 |
| 695.93281825 | 0 |
| 696.05362272 | 0 |
| 696.17442843 | 0 |
| 696.2952354 | 0 |
| 696.4160436 | 0 |
| 696.53685305 | 0 |
| 696.65766374 | 0 |
| 696.77847566 | 0 |
| 696.89928883 | 0 |
| 697.02010323 | 0 |
| 697.14091886 | 0 |
| 697.26173573 | 0 |
| 697.38255382 | 0 |
| 697.50337315 | 0 |
| 697.6241937 | 0 |
| 697.74501549 | 0 |
| 697.86583849 | 0 |
| 697.98666272 | 0 |
| 698.10748817 | 0 |
| 698.22831485 | 0 |
| 698.34914274 | 0 |
| 698.46997184 | 0 |
| 698.59080217 | 0 |
| 698.71163371 | 0 |
| 698.83246646 | 0 |
| 698.95330042 | 0 |
| 699.07413559 | 0 |
| 699.19497197 | 0 |
| 699.31580955 | 0 |
| 699.43664834 | 0 |
| 699.55748834 | 0 |
| 699.67832953 | 0 |
| 699.79917193 | 0 |
| 699.92001552 | 0 |
| 700.04086031 | 0 |
| 700.1617063 | 0 |
| 700.28255348 | 0 |
| 700.40340185 | 0 |
| 700.52425142 | 0 |
| 700.64510217 | 0 |
| 700.76595412 | 0 |
| 700.88680724 | 0 |
| 701.00766156 | 0 |
| 701.12851705 | 0 |
| 701.24937373 | 0 |
| 701.37023159 | 0 |
| 701.49109063 | 0 |
| 701.61195084 | 0 |
| 701.73281223 | 0 |
| 701.8536748 | 0 |
| 701.97453853 | 0 |
| 702.09540344 | 0 |
| 702.21626952 | 0 |
| 702.33713676 | 0 |
| 702.45800517 | 0 |
| 702.57887475 | 0 |
| 702.69974549 | 0 |
| 702.82061739 | 0 |
| 702.94149045 | 0 |
| 703.06236467 | 0 |
| 703.18324005 | 0 |
| 703.30411658 | 0 |
| 703.42499426 | 0 |
| 703.5458731 | 0 |
| 703.66675309 | 0 |
| 703.78763423 | 0 |
| 703.90851652 | 0 |
| 704.02939995 | 0 |
| 704.15028453 | 0 |
| 704.27117025 | 0 |
| 704.39205711 | 0 |
| 704.51294511 | 0 |
| 704.63383425 | 0 |
| 704.75472453 | 0 |
| 704.87561595 | 0 |
| 704.99650849 | 0 |
| 705.11740217 | 0 |
| 705.23829698 | 0 |
| 705.35919293 | 0 |
| 705.48008999 | 0 |
| 705.60098819 | 0 |
| 705.72188751 | 0 |
| 705.84278795 | 0 |
| 705.96368951 | 0 |
| 706.0845922 | 0 |
| 706.205496 | 0 |
| 706.32640092 | 0 |
| 706.44730695 | 0 |
| 706.5682141 | 0 |
| 706.68912236 | 0 |
| 706.81003173 | 0 |
| 706.93094221 | 0 |
| 707.0518538 | 0 |
| 707.1727665 | 0 |
| 707.2936803 | 0 |
| 707.4145952 | 0 |
| 707.5355112 | 0 |
| 707.65642831 | 0 |
| 707.77734651 | 0 |
| 707.89826581 | 0 |
| 708.0191862 | 0 |
| 708.14010769 | 0 |
| 708.26103027 | 0 |
| 708.38195394 | 0 |
| 708.50287871 | 0 |
| 708.62380455 | 0 |
| 708.74473149 | 0 |
| 708.86565951 | 0 |
| 708.98658861 | 0 |
| 709.10751879 | 0 |
| 709.22845006 | 0 |
| 709.3493824 | 0 |
| 709.47031582 | 0 |
| 709.59125031 | 0 |
| 709.71218588 | 0 |
| 709.83312252 | 0 |
| 709.95406023 | 0 |
| 710.07499901 | 0 |
| 710.19593886 | 0 |
| 710.31687978 | 0 |
| 710.43782175 | 0 |
| 710.5587648 | 0 |
| 710.6797089 | 0 |
| 710.80065406 | 0 |
| 710.92160028 | 0 |
| 711.04254756 | 0 |
| 711.16349589 | 0 |
| 711.28444528 | 0 |
| 711.40539572 | 0 |
| 711.52634721 | 0 |
| 711.64729975 | 0 |
| 711.76825334 | 0 |
| 711.88920797 | 0 |
| 712.01016365 | 0 |
| 712.13112037 | 0 |
| 712.25207813 | 0 |
| 712.37303693 | 0 |
| 712.49399677 | 0 |
| 712.61495764 | 0 |
| 712.73591956 | 0 |
| 712.8568825 | 0 |
| 712.97784648 | 0 |
| 713.09881149 | 0 |
| 713.21977752 | 0 |
| 713.34074459 | 0 |
| 713.46171268 | 0 |
| 713.58268179 | 0 |
| 713.70365193 | 0 |
| 713.82462309 | 0 |
| 713.94559527 | 0 |
| 714.06656847 | 0 |
| 714.18754268 | 0 |
| 714.30851791 | 0 |
| 714.42949415 | 0 |
| 714.55047141 | 0 |
| 714.67144968 | 0 |
| 714.79242895 | 0 |
| 714.91340923 | 0 |
| 715.03439052 | 0 |
| 715.15537281 | 0 |
| 715.27635611 | 0 |
| 715.3973404 | 0 |
| 715.5183257 | 0 |
| 715.63931199 | 0 |
| 715.76029929 | 0 |
| 715.88128757 | 0 |
| 716.00227685 | 0 |
| 716.12326712 | 0 |
| 716.24425839 | 0 |
| 716.36525064 | 0 |
| 716.48624388 | 0 |
| 716.6072381 | 0 |
| 716.72823331 | 0 |
| 716.8492295 | 0 |
| 716.97022668 | 0 |
| 717.09122483 | 0 |
| 717.21222396 | 0 |
| 717.33322407 | 0 |
| 717.45422515 | 0 |
| 717.57522721 | 0 |
| 717.69623023 | 0 |
| 717.81723423 | 0 |
| 717.9382392 | 0 |
| 718.05924513 | 0 |
| 718.18025204 | 0 |
| 718.3012599 | 0 |
| 718.42226873 | 0 |
| 718.54327852 | 0 |
| 718.66428927 | 0 |
| 718.78530097 | 0 |
| 718.90631364 | 0 |
| 719.02732725 | 0 |
| 719.14834183 | 0 |
| 719.26935735 | 0 |
| 719.39037382 | 0 |
| 719.51139125 | 0 |
| 719.63240962 | 0 |
| 719.75342893 | 0 |
| 719.87444919 | 0 |
| 719.9954704 | 0 |
| 720.11649254 | 0 |
| 720.23751562 | 0 |
| 720.35853965 | 0 |
| 720.4795646 | 0 |
| 720.6005905 | 0 |
| 720.72161732 | 0 |
| 720.84264508 | 0 |
| 720.96367377 | 0 |
| 721.08470339 | 0 |
| 721.20573393 | 0 |
| 721.32676541 | 0 |
| 721.4477978 | 0 |
| 721.56883112 | 0 |
| 721.68986536 | 0 |
| 721.81090052 | 0 |
| 721.93193659 | 0 |
| 722.05297358 | 0 |
| 722.17401149 | 0 |
| 722.29505031 | 0 |
| 722.41609005 | 0 |
| 722.53713069 | 0 |
| 722.65817224 | 0 |
| 722.7792147 | 0 |
| 722.90025807 | 0 |
| 723.02130233 | 0 |
| 723.14234751 | 0 |
| 723.26339358 | 0 |
| 723.38444055 | 0 |
| 723.50548842 | 0 |
| 723.62653719 | 0 |
| 723.74758685 | 0 |
| 723.8686374 | 0 |
| 723.98968885 | 0 |
| 724.11074119 | 0 |
| 724.23179441 | 0 |
| 724.35284853 | 0 |
| 724.47390352 | 0 |
| 724.59495941 | 0 |
| 724.71601617 | 0 |
| 724.83707382 | 0 |
| 724.95813234 | 0 |
| 725.07919175 | 0 |
| 725.20025203 | 0 |
| 725.32131318 | 0 |
| 725.44237521 | 0 |
| 725.56343811 | 0 |
| 725.68450188 | 0 |
| 725.80556652 | 0 |
| 725.92663202 | 0 |
| 726.04769839 | 0 |
| 726.16876563 | 0 |
| 726.28983373 | 0 |
| 726.41090268 | 0 |
| 726.5319725 | 0 |
| 726.65304318 | 0 |
| 726.77411471 | 0 |
| 726.8951871 | 0 |
| 727.01626034 | 0 |
| 727.13733443 | 0 |
| 727.25840937 | 0 |
| 727.37948516 | 0 |
| 727.5005618 | 0 |
| 727.62163928 | 0 |
| 727.74271761 | 0 |
| 727.86379678 | 0 |
| 727.98487679 | 0 |
| 728.10595764 | 0 |
| 728.22703933 | 0 |
| 728.34812185 | 0 |
| 728.46920521 | 0 |
| 728.5902894 | 0 |
| 728.71137443 | 0 |
| 728.83246028 | 0 |
| 728.95354696 | 0 |
| 729.07463447 | 0 |
| 729.19572281 | 0 |
| 729.31681196 | 0 |
| 729.43790195 | 0 |
| 729.55899275 | 0 |
| 729.68008437 | 0 |
| 729.80117681 | 0 |
| 729.92227006 | 0 |
| 730.04336413 | 0 |
| 730.16445902 | 0 |
| 730.28555471 | 0 |
| 730.40665121 | 0 |
| 730.52774853 | 0 |
| 730.64884665 | 0 |
| 730.76994557 | 0 |
| 730.8910453 | 0 |
| 731.01214583 | 0 |
| 731.13324717 | 0 |
| 731.2543493 | 0 |
| 731.37545223 | 0 |
| 731.49655595 | 0 |
| 731.61766047 | 0 |
| 731.73876579 | 0 |
| 731.85987189 | 0 |
| 731.98097879 | 0 |
| 732.10208647 | 0 |
| 732.22319494 | 0 |
| 732.3443042 | 0 |
| 732.46541424 | 0 |
| 732.58652506 | 0 |
| 732.70763666 | 0 |
| 732.82874904 | 0 |
| 732.9498622 | 0 |
| 733.07097614 | 0 |
| 733.19209085 | 0 |
| 733.31320633 | 0 |
| 733.43432259 | 0 |
| 733.55543961 | 0 |
| 733.6765574 | 0 |
| 733.79767596 | 0 |
| 733.91879529 | 0 |
| 734.03991538 | 0 |
| 734.16103623 | 0 |
| 734.28215784 | 0 |
| 734.40328021 | 0 |
| 734.52440334 | 0 |
| 734.64552723 | 0 |
| 734.76665187 | 0 |
| 734.88777726 | 0 |
| 735.0089034 | 0 |
| 735.1300303 | 0 |
| 735.25115794 | 0 |
| 735.37228633 | 0 |
| 735.49341546 | 0 |
| 735.61454534 | 0 |
| 735.73567596 | 0 |
| 735.85680732 | 0 |
| 735.97793942 | 0 |
| 736.09907226 | 0 |
| 736.22020583 | 0 |
| 736.34134014 | 0 |
| 736.46247518 | 0 |
| 736.58361095 | 0 |
| 736.70474745 | 0 |
| 736.82588468 | 0 |
| 736.94702264 | 0 |
| 737.06816132 | 0 |
| 737.18930073 | 0 |
| 737.31044086 | 0 |
| 737.43158171 | 0 |
| 737.55272327 | 0 |
| 737.67386556 | 0 |
| 737.79500856 | 0 |
| 737.91615228 | 0 |
| 738.0372967 | 0 |
| 738.15844184 | 0 |
| 738.27958769 | 0 |
| 738.40073425 | 0 |
| 738.52188152 | 0 |
| 738.64302949 | 0 |
| 738.76417816 | 0 |
| 738.88532754 | 0 |
| 739.00647761 | 0 |
| 739.12762839 | 0 |
| 739.24877986 | 0 |
| 739.36993203 | 0 |
| 739.49108489 | 0 |
| 739.61223845 | 0 |
| 739.73339269 | 0 |
| 739.85454763 | 0 |
| 739.97570326 | 0 |
| 740.09685957 | 0 |
| 740.21801656 | 0 |
| 740.33917425 | 0 |
| 740.46033261 | 0 |
| 740.58149165 | 0 |
| 740.70265137 | 0 |
| 740.82381177 | 0 |
| 740.94497285 | 0 |
| 741.0661346 | 0 |
| 741.18729702 | 0 |
| 741.30846011 | 0 |
| 741.42962388 | 0 |
| 741.55078831 | 0 |
| 741.6719534 | 0 |
| 741.79311917 | 0 |
| 741.91428559 | 0 |
| 742.03545268 | 0 |
| 742.15662043 | 0 |
| 742.27778884 | 0 |
| 742.39895791 | 0 |
| 742.52012763 | 0 |
| 742.641298 | 0 |
| 742.76246903 | 0 |
| 742.88364071 | 0 |
| 743.00481304 | 0 |
| 743.12598602 | 0 |
| 743.24715964 | 0 |
| 743.36833391 | 0 |
| 743.48950882 | 0 |
| 743.61068437 | 0 |
| 743.73186057 | 0 |
| 743.8530374 | 0 |
| 743.97421487 | 0 |
| 744.09539298 | 0 |
| 744.21657172 | 0 |
| 744.33775109 | 0 |
| 744.4589311 | 0 |
| 744.58011173 | 0 |
| 744.70129299 | 0 |
| 744.82247488 | 0 |
| 744.9436574 | 0 |
| 745.06484053 | 0 |
| 745.18602429 | 0 |
| 745.30720867 | 0 |
| 745.42839367 | 0 |
| 745.54957929 | 0 |